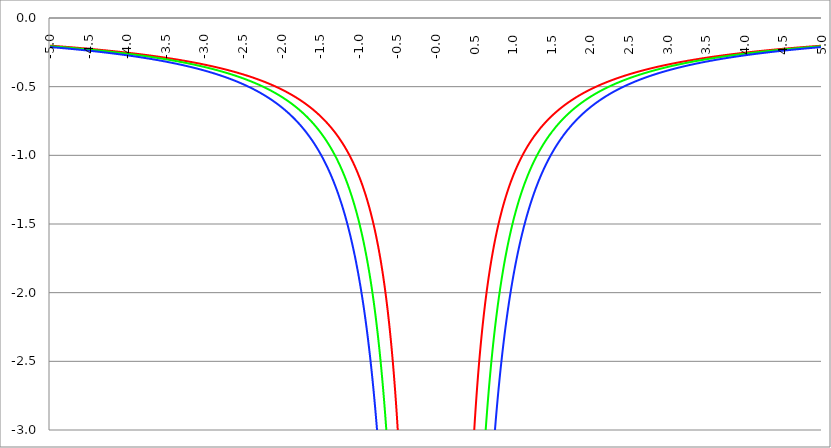
| Category | Series 1 | Series 0 | Series 2 |
|---|---|---|---|
| -5.0 | -0.201 | -0.205 | -0.211 |
| -4.995 | -0.202 | -0.205 | -0.212 |
| -4.99 | -0.202 | -0.206 | -0.212 |
| -4.985 | -0.202 | -0.206 | -0.212 |
| -4.98 | -0.202 | -0.206 | -0.212 |
| -4.975 | -0.202 | -0.206 | -0.213 |
| -4.97 | -0.203 | -0.207 | -0.213 |
| -4.965000000000001 | -0.203 | -0.207 | -0.213 |
| -4.960000000000001 | -0.203 | -0.207 | -0.213 |
| -4.955000000000001 | -0.203 | -0.207 | -0.214 |
| -4.950000000000001 | -0.203 | -0.207 | -0.214 |
| -4.945000000000001 | -0.204 | -0.208 | -0.214 |
| -4.940000000000001 | -0.204 | -0.208 | -0.214 |
| -4.935000000000001 | -0.204 | -0.208 | -0.215 |
| -4.930000000000001 | -0.204 | -0.208 | -0.215 |
| -4.925000000000002 | -0.204 | -0.208 | -0.215 |
| -4.920000000000002 | -0.205 | -0.209 | -0.215 |
| -4.915000000000002 | -0.205 | -0.209 | -0.215 |
| -4.910000000000002 | -0.205 | -0.209 | -0.216 |
| -4.905000000000002 | -0.205 | -0.209 | -0.216 |
| -4.900000000000002 | -0.205 | -0.21 | -0.216 |
| -4.895000000000002 | -0.206 | -0.21 | -0.216 |
| -4.890000000000002 | -0.206 | -0.21 | -0.217 |
| -4.885000000000002 | -0.206 | -0.21 | -0.217 |
| -4.880000000000002 | -0.206 | -0.211 | -0.217 |
| -4.875000000000003 | -0.207 | -0.211 | -0.217 |
| -4.870000000000003 | -0.207 | -0.211 | -0.218 |
| -4.865000000000003 | -0.207 | -0.211 | -0.218 |
| -4.860000000000003 | -0.207 | -0.211 | -0.218 |
| -4.855000000000003 | -0.207 | -0.212 | -0.218 |
| -4.850000000000003 | -0.208 | -0.212 | -0.219 |
| -4.845000000000003 | -0.208 | -0.212 | -0.219 |
| -4.840000000000003 | -0.208 | -0.212 | -0.219 |
| -4.835000000000003 | -0.208 | -0.213 | -0.219 |
| -4.830000000000004 | -0.209 | -0.213 | -0.22 |
| -4.825000000000004 | -0.209 | -0.213 | -0.22 |
| -4.820000000000004 | -0.209 | -0.213 | -0.22 |
| -4.815000000000004 | -0.209 | -0.214 | -0.22 |
| -4.810000000000004 | -0.209 | -0.214 | -0.221 |
| -4.805000000000004 | -0.21 | -0.214 | -0.221 |
| -4.800000000000004 | -0.21 | -0.214 | -0.221 |
| -4.795000000000004 | -0.21 | -0.214 | -0.221 |
| -4.790000000000004 | -0.21 | -0.215 | -0.222 |
| -4.785000000000004 | -0.21 | -0.215 | -0.222 |
| -4.780000000000004 | -0.211 | -0.215 | -0.222 |
| -4.775000000000004 | -0.211 | -0.215 | -0.222 |
| -4.770000000000004 | -0.211 | -0.216 | -0.223 |
| -4.765000000000005 | -0.211 | -0.216 | -0.223 |
| -4.760000000000005 | -0.212 | -0.216 | -0.223 |
| -4.755000000000005 | -0.212 | -0.216 | -0.224 |
| -4.750000000000005 | -0.212 | -0.217 | -0.224 |
| -4.745000000000005 | -0.212 | -0.217 | -0.224 |
| -4.740000000000005 | -0.213 | -0.217 | -0.224 |
| -4.735000000000005 | -0.213 | -0.217 | -0.225 |
| -4.730000000000005 | -0.213 | -0.218 | -0.225 |
| -4.725000000000006 | -0.213 | -0.218 | -0.225 |
| -4.720000000000006 | -0.213 | -0.218 | -0.225 |
| -4.715000000000006 | -0.214 | -0.218 | -0.226 |
| -4.710000000000006 | -0.214 | -0.219 | -0.226 |
| -4.705000000000006 | -0.214 | -0.219 | -0.226 |
| -4.700000000000006 | -0.214 | -0.219 | -0.226 |
| -4.695000000000006 | -0.215 | -0.219 | -0.227 |
| -4.690000000000006 | -0.215 | -0.22 | -0.227 |
| -4.685000000000007 | -0.215 | -0.22 | -0.227 |
| -4.680000000000007 | -0.215 | -0.22 | -0.228 |
| -4.675000000000007 | -0.216 | -0.22 | -0.228 |
| -4.670000000000007 | -0.216 | -0.221 | -0.228 |
| -4.665000000000007 | -0.216 | -0.221 | -0.228 |
| -4.660000000000007 | -0.216 | -0.221 | -0.229 |
| -4.655000000000007 | -0.216 | -0.221 | -0.229 |
| -4.650000000000007 | -0.217 | -0.222 | -0.229 |
| -4.645000000000007 | -0.217 | -0.222 | -0.229 |
| -4.640000000000008 | -0.217 | -0.222 | -0.23 |
| -4.635000000000008 | -0.217 | -0.222 | -0.23 |
| -4.630000000000008 | -0.218 | -0.223 | -0.23 |
| -4.625000000000008 | -0.218 | -0.223 | -0.231 |
| -4.620000000000008 | -0.218 | -0.223 | -0.231 |
| -4.615000000000008 | -0.218 | -0.223 | -0.231 |
| -4.610000000000008 | -0.219 | -0.224 | -0.231 |
| -4.605000000000008 | -0.219 | -0.224 | -0.232 |
| -4.600000000000008 | -0.219 | -0.224 | -0.232 |
| -4.595000000000009 | -0.219 | -0.224 | -0.232 |
| -4.590000000000009 | -0.22 | -0.225 | -0.233 |
| -4.585000000000009 | -0.22 | -0.225 | -0.233 |
| -4.580000000000009 | -0.22 | -0.225 | -0.233 |
| -4.57500000000001 | -0.22 | -0.225 | -0.233 |
| -4.57000000000001 | -0.221 | -0.226 | -0.234 |
| -4.565000000000009 | -0.221 | -0.226 | -0.234 |
| -4.560000000000009 | -0.221 | -0.226 | -0.234 |
| -4.555000000000009 | -0.221 | -0.226 | -0.235 |
| -4.55000000000001 | -0.222 | -0.227 | -0.235 |
| -4.54500000000001 | -0.222 | -0.227 | -0.235 |
| -4.54000000000001 | -0.222 | -0.227 | -0.235 |
| -4.53500000000001 | -0.222 | -0.227 | -0.236 |
| -4.53000000000001 | -0.223 | -0.228 | -0.236 |
| -4.52500000000001 | -0.223 | -0.228 | -0.236 |
| -4.52000000000001 | -0.223 | -0.228 | -0.237 |
| -4.51500000000001 | -0.223 | -0.229 | -0.237 |
| -4.51000000000001 | -0.224 | -0.229 | -0.237 |
| -4.505000000000011 | -0.224 | -0.229 | -0.237 |
| -4.500000000000011 | -0.224 | -0.229 | -0.238 |
| -4.495000000000011 | -0.224 | -0.23 | -0.238 |
| -4.490000000000011 | -0.225 | -0.23 | -0.238 |
| -4.485000000000011 | -0.225 | -0.23 | -0.239 |
| -4.480000000000011 | -0.225 | -0.23 | -0.239 |
| -4.475000000000011 | -0.225 | -0.231 | -0.239 |
| -4.470000000000011 | -0.226 | -0.231 | -0.24 |
| -4.465000000000011 | -0.226 | -0.231 | -0.24 |
| -4.460000000000011 | -0.226 | -0.232 | -0.24 |
| -4.455000000000012 | -0.226 | -0.232 | -0.24 |
| -4.450000000000012 | -0.227 | -0.232 | -0.241 |
| -4.445000000000012 | -0.227 | -0.232 | -0.241 |
| -4.440000000000012 | -0.227 | -0.233 | -0.241 |
| -4.435000000000012 | -0.227 | -0.233 | -0.242 |
| -4.430000000000012 | -0.228 | -0.233 | -0.242 |
| -4.425000000000012 | -0.228 | -0.233 | -0.242 |
| -4.420000000000012 | -0.228 | -0.234 | -0.243 |
| -4.415000000000012 | -0.228 | -0.234 | -0.243 |
| -4.410000000000013 | -0.229 | -0.234 | -0.243 |
| -4.405000000000013 | -0.229 | -0.235 | -0.244 |
| -4.400000000000013 | -0.229 | -0.235 | -0.244 |
| -4.395000000000013 | -0.229 | -0.235 | -0.244 |
| -4.390000000000013 | -0.23 | -0.235 | -0.244 |
| -4.385000000000013 | -0.23 | -0.236 | -0.245 |
| -4.380000000000013 | -0.23 | -0.236 | -0.245 |
| -4.375000000000013 | -0.231 | -0.236 | -0.245 |
| -4.370000000000013 | -0.231 | -0.237 | -0.246 |
| -4.365000000000013 | -0.231 | -0.237 | -0.246 |
| -4.360000000000014 | -0.231 | -0.237 | -0.246 |
| -4.355000000000014 | -0.232 | -0.237 | -0.247 |
| -4.350000000000014 | -0.232 | -0.238 | -0.247 |
| -4.345000000000014 | -0.232 | -0.238 | -0.247 |
| -4.340000000000014 | -0.232 | -0.238 | -0.248 |
| -4.335000000000014 | -0.233 | -0.239 | -0.248 |
| -4.330000000000014 | -0.233 | -0.239 | -0.248 |
| -4.325000000000014 | -0.233 | -0.239 | -0.249 |
| -4.320000000000014 | -0.234 | -0.24 | -0.249 |
| -4.315000000000015 | -0.234 | -0.24 | -0.249 |
| -4.310000000000015 | -0.234 | -0.24 | -0.25 |
| -4.305000000000015 | -0.234 | -0.24 | -0.25 |
| -4.300000000000015 | -0.235 | -0.241 | -0.25 |
| -4.295000000000015 | -0.235 | -0.241 | -0.251 |
| -4.290000000000015 | -0.235 | -0.241 | -0.251 |
| -4.285000000000015 | -0.235 | -0.242 | -0.251 |
| -4.280000000000015 | -0.236 | -0.242 | -0.252 |
| -4.275000000000015 | -0.236 | -0.242 | -0.252 |
| -4.270000000000015 | -0.236 | -0.242 | -0.252 |
| -4.265000000000016 | -0.237 | -0.243 | -0.253 |
| -4.260000000000016 | -0.237 | -0.243 | -0.253 |
| -4.255000000000016 | -0.237 | -0.243 | -0.253 |
| -4.250000000000016 | -0.237 | -0.244 | -0.254 |
| -4.245000000000016 | -0.238 | -0.244 | -0.254 |
| -4.240000000000016 | -0.238 | -0.244 | -0.254 |
| -4.235000000000016 | -0.238 | -0.245 | -0.255 |
| -4.230000000000016 | -0.239 | -0.245 | -0.255 |
| -4.225000000000017 | -0.239 | -0.245 | -0.255 |
| -4.220000000000017 | -0.239 | -0.246 | -0.256 |
| -4.215000000000017 | -0.239 | -0.246 | -0.256 |
| -4.210000000000017 | -0.24 | -0.246 | -0.256 |
| -4.205000000000017 | -0.24 | -0.246 | -0.257 |
| -4.200000000000017 | -0.24 | -0.247 | -0.257 |
| -4.195000000000017 | -0.241 | -0.247 | -0.257 |
| -4.190000000000017 | -0.241 | -0.247 | -0.258 |
| -4.185000000000017 | -0.241 | -0.248 | -0.258 |
| -4.180000000000017 | -0.241 | -0.248 | -0.258 |
| -4.175000000000018 | -0.242 | -0.248 | -0.259 |
| -4.170000000000018 | -0.242 | -0.249 | -0.259 |
| -4.165000000000018 | -0.242 | -0.249 | -0.259 |
| -4.160000000000018 | -0.243 | -0.249 | -0.26 |
| -4.155000000000018 | -0.243 | -0.25 | -0.26 |
| -4.150000000000018 | -0.243 | -0.25 | -0.261 |
| -4.145000000000018 | -0.244 | -0.25 | -0.261 |
| -4.140000000000018 | -0.244 | -0.251 | -0.261 |
| -4.135000000000018 | -0.244 | -0.251 | -0.262 |
| -4.130000000000019 | -0.244 | -0.251 | -0.262 |
| -4.125000000000019 | -0.245 | -0.252 | -0.262 |
| -4.120000000000019 | -0.245 | -0.252 | -0.263 |
| -4.115000000000019 | -0.245 | -0.252 | -0.263 |
| -4.110000000000019 | -0.246 | -0.253 | -0.263 |
| -4.105000000000019 | -0.246 | -0.253 | -0.264 |
| -4.100000000000019 | -0.246 | -0.253 | -0.264 |
| -4.095000000000019 | -0.247 | -0.254 | -0.265 |
| -4.090000000000019 | -0.247 | -0.254 | -0.265 |
| -4.085000000000019 | -0.247 | -0.254 | -0.265 |
| -4.08000000000002 | -0.248 | -0.255 | -0.266 |
| -4.07500000000002 | -0.248 | -0.255 | -0.266 |
| -4.07000000000002 | -0.248 | -0.255 | -0.266 |
| -4.06500000000002 | -0.248 | -0.256 | -0.267 |
| -4.06000000000002 | -0.249 | -0.256 | -0.267 |
| -4.05500000000002 | -0.249 | -0.256 | -0.268 |
| -4.05000000000002 | -0.249 | -0.257 | -0.268 |
| -4.04500000000002 | -0.25 | -0.257 | -0.268 |
| -4.04000000000002 | -0.25 | -0.257 | -0.269 |
| -4.03500000000002 | -0.25 | -0.258 | -0.269 |
| -4.03000000000002 | -0.251 | -0.258 | -0.269 |
| -4.025000000000021 | -0.251 | -0.258 | -0.27 |
| -4.020000000000021 | -0.251 | -0.259 | -0.27 |
| -4.015000000000021 | -0.252 | -0.259 | -0.271 |
| -4.010000000000021 | -0.252 | -0.259 | -0.271 |
| -4.005000000000021 | -0.252 | -0.26 | -0.271 |
| -4.000000000000021 | -0.253 | -0.26 | -0.272 |
| -3.995000000000021 | -0.253 | -0.26 | -0.272 |
| -3.990000000000021 | -0.253 | -0.261 | -0.273 |
| -3.985000000000022 | -0.254 | -0.261 | -0.273 |
| -3.980000000000022 | -0.254 | -0.261 | -0.273 |
| -3.975000000000022 | -0.254 | -0.262 | -0.274 |
| -3.970000000000022 | -0.255 | -0.262 | -0.274 |
| -3.965000000000022 | -0.255 | -0.263 | -0.275 |
| -3.960000000000022 | -0.255 | -0.263 | -0.275 |
| -3.955000000000022 | -0.256 | -0.263 | -0.275 |
| -3.950000000000022 | -0.256 | -0.264 | -0.276 |
| -3.945000000000022 | -0.256 | -0.264 | -0.276 |
| -3.940000000000023 | -0.257 | -0.264 | -0.277 |
| -3.935000000000023 | -0.257 | -0.265 | -0.277 |
| -3.930000000000023 | -0.257 | -0.265 | -0.277 |
| -3.925000000000023 | -0.258 | -0.265 | -0.278 |
| -3.920000000000023 | -0.258 | -0.266 | -0.278 |
| -3.915000000000023 | -0.258 | -0.266 | -0.279 |
| -3.910000000000023 | -0.259 | -0.267 | -0.279 |
| -3.905000000000023 | -0.259 | -0.267 | -0.279 |
| -3.900000000000023 | -0.259 | -0.267 | -0.28 |
| -3.895000000000023 | -0.26 | -0.268 | -0.28 |
| -3.890000000000024 | -0.26 | -0.268 | -0.281 |
| -3.885000000000024 | -0.26 | -0.268 | -0.281 |
| -3.880000000000024 | -0.261 | -0.269 | -0.281 |
| -3.875000000000024 | -0.261 | -0.269 | -0.282 |
| -3.870000000000024 | -0.261 | -0.269 | -0.282 |
| -3.865000000000024 | -0.262 | -0.27 | -0.283 |
| -3.860000000000024 | -0.262 | -0.27 | -0.283 |
| -3.855000000000024 | -0.262 | -0.271 | -0.284 |
| -3.850000000000024 | -0.263 | -0.271 | -0.284 |
| -3.845000000000025 | -0.263 | -0.271 | -0.284 |
| -3.840000000000025 | -0.263 | -0.272 | -0.285 |
| -3.835000000000025 | -0.264 | -0.272 | -0.285 |
| -3.830000000000025 | -0.264 | -0.273 | -0.286 |
| -3.825000000000025 | -0.264 | -0.273 | -0.286 |
| -3.820000000000025 | -0.265 | -0.273 | -0.287 |
| -3.815000000000025 | -0.265 | -0.274 | -0.287 |
| -3.810000000000025 | -0.265 | -0.274 | -0.287 |
| -3.805000000000025 | -0.266 | -0.274 | -0.288 |
| -3.800000000000026 | -0.266 | -0.275 | -0.288 |
| -3.795000000000026 | -0.267 | -0.275 | -0.289 |
| -3.790000000000026 | -0.267 | -0.276 | -0.289 |
| -3.785000000000026 | -0.267 | -0.276 | -0.29 |
| -3.780000000000026 | -0.268 | -0.276 | -0.29 |
| -3.775000000000026 | -0.268 | -0.277 | -0.291 |
| -3.770000000000026 | -0.268 | -0.277 | -0.291 |
| -3.765000000000026 | -0.269 | -0.278 | -0.292 |
| -3.760000000000026 | -0.269 | -0.278 | -0.292 |
| -3.755000000000026 | -0.269 | -0.278 | -0.292 |
| -3.750000000000027 | -0.27 | -0.279 | -0.293 |
| -3.745000000000027 | -0.27 | -0.279 | -0.293 |
| -3.740000000000027 | -0.271 | -0.28 | -0.294 |
| -3.735000000000027 | -0.271 | -0.28 | -0.294 |
| -3.730000000000027 | -0.271 | -0.28 | -0.295 |
| -3.725000000000027 | -0.272 | -0.281 | -0.295 |
| -3.720000000000027 | -0.272 | -0.281 | -0.296 |
| -3.715000000000027 | -0.272 | -0.282 | -0.296 |
| -3.710000000000027 | -0.273 | -0.282 | -0.297 |
| -3.705000000000028 | -0.273 | -0.282 | -0.297 |
| -3.700000000000028 | -0.274 | -0.283 | -0.297 |
| -3.695000000000028 | -0.274 | -0.283 | -0.298 |
| -3.690000000000028 | -0.274 | -0.284 | -0.298 |
| -3.685000000000028 | -0.275 | -0.284 | -0.299 |
| -3.680000000000028 | -0.275 | -0.285 | -0.299 |
| -3.675000000000028 | -0.275 | -0.285 | -0.3 |
| -3.670000000000028 | -0.276 | -0.285 | -0.3 |
| -3.665000000000028 | -0.276 | -0.286 | -0.301 |
| -3.660000000000028 | -0.277 | -0.286 | -0.301 |
| -3.655000000000029 | -0.277 | -0.287 | -0.302 |
| -3.650000000000029 | -0.277 | -0.287 | -0.302 |
| -3.645000000000029 | -0.278 | -0.288 | -0.303 |
| -3.640000000000029 | -0.278 | -0.288 | -0.303 |
| -3.635000000000029 | -0.279 | -0.288 | -0.304 |
| -3.630000000000029 | -0.279 | -0.289 | -0.304 |
| -3.625000000000029 | -0.279 | -0.289 | -0.305 |
| -3.620000000000029 | -0.28 | -0.29 | -0.305 |
| -3.615000000000029 | -0.28 | -0.29 | -0.306 |
| -3.61000000000003 | -0.281 | -0.291 | -0.306 |
| -3.60500000000003 | -0.281 | -0.291 | -0.307 |
| -3.60000000000003 | -0.281 | -0.291 | -0.307 |
| -3.59500000000003 | -0.282 | -0.292 | -0.308 |
| -3.59000000000003 | -0.282 | -0.292 | -0.308 |
| -3.58500000000003 | -0.283 | -0.293 | -0.309 |
| -3.58000000000003 | -0.283 | -0.293 | -0.309 |
| -3.57500000000003 | -0.283 | -0.294 | -0.31 |
| -3.57000000000003 | -0.284 | -0.294 | -0.31 |
| -3.565000000000031 | -0.284 | -0.295 | -0.311 |
| -3.560000000000031 | -0.285 | -0.295 | -0.311 |
| -3.555000000000031 | -0.285 | -0.295 | -0.312 |
| -3.550000000000031 | -0.285 | -0.296 | -0.312 |
| -3.545000000000031 | -0.286 | -0.296 | -0.313 |
| -3.540000000000031 | -0.286 | -0.297 | -0.313 |
| -3.535000000000031 | -0.287 | -0.297 | -0.314 |
| -3.530000000000031 | -0.287 | -0.298 | -0.314 |
| -3.525000000000031 | -0.287 | -0.298 | -0.315 |
| -3.520000000000032 | -0.288 | -0.299 | -0.315 |
| -3.515000000000032 | -0.288 | -0.299 | -0.316 |
| -3.510000000000032 | -0.289 | -0.3 | -0.317 |
| -3.505000000000032 | -0.289 | -0.3 | -0.317 |
| -3.500000000000032 | -0.29 | -0.301 | -0.318 |
| -3.495000000000032 | -0.29 | -0.301 | -0.318 |
| -3.490000000000032 | -0.29 | -0.302 | -0.319 |
| -3.485000000000032 | -0.291 | -0.302 | -0.319 |
| -3.480000000000032 | -0.291 | -0.302 | -0.32 |
| -3.475000000000032 | -0.292 | -0.303 | -0.32 |
| -3.470000000000033 | -0.292 | -0.303 | -0.321 |
| -3.465000000000033 | -0.293 | -0.304 | -0.321 |
| -3.460000000000033 | -0.293 | -0.304 | -0.322 |
| -3.455000000000033 | -0.293 | -0.305 | -0.323 |
| -3.450000000000033 | -0.294 | -0.305 | -0.323 |
| -3.445000000000033 | -0.294 | -0.306 | -0.324 |
| -3.440000000000033 | -0.295 | -0.306 | -0.324 |
| -3.435000000000033 | -0.295 | -0.307 | -0.325 |
| -3.430000000000033 | -0.296 | -0.307 | -0.325 |
| -3.425000000000034 | -0.296 | -0.308 | -0.326 |
| -3.420000000000034 | -0.297 | -0.308 | -0.326 |
| -3.415000000000034 | -0.297 | -0.309 | -0.327 |
| -3.410000000000034 | -0.297 | -0.309 | -0.328 |
| -3.405000000000034 | -0.298 | -0.31 | -0.328 |
| -3.400000000000034 | -0.298 | -0.31 | -0.329 |
| -3.395000000000034 | -0.299 | -0.311 | -0.329 |
| -3.390000000000034 | -0.299 | -0.311 | -0.33 |
| -3.385000000000034 | -0.3 | -0.312 | -0.33 |
| -3.380000000000034 | -0.3 | -0.312 | -0.331 |
| -3.375000000000035 | -0.301 | -0.313 | -0.332 |
| -3.370000000000035 | -0.301 | -0.313 | -0.332 |
| -3.365000000000035 | -0.301 | -0.314 | -0.333 |
| -3.360000000000035 | -0.302 | -0.314 | -0.333 |
| -3.355000000000035 | -0.302 | -0.315 | -0.334 |
| -3.350000000000035 | -0.303 | -0.315 | -0.335 |
| -3.345000000000035 | -0.303 | -0.316 | -0.335 |
| -3.340000000000035 | -0.304 | -0.316 | -0.336 |
| -3.335000000000035 | -0.304 | -0.317 | -0.336 |
| -3.330000000000036 | -0.305 | -0.317 | -0.337 |
| -3.325000000000036 | -0.305 | -0.318 | -0.338 |
| -3.320000000000036 | -0.306 | -0.319 | -0.338 |
| -3.315000000000036 | -0.306 | -0.319 | -0.339 |
| -3.310000000000036 | -0.307 | -0.32 | -0.339 |
| -3.305000000000036 | -0.307 | -0.32 | -0.34 |
| -3.300000000000036 | -0.308 | -0.321 | -0.341 |
| -3.295000000000036 | -0.308 | -0.321 | -0.341 |
| -3.290000000000036 | -0.309 | -0.322 | -0.342 |
| -3.285000000000036 | -0.309 | -0.322 | -0.343 |
| -3.280000000000036 | -0.31 | -0.323 | -0.343 |
| -3.275000000000037 | -0.31 | -0.323 | -0.344 |
| -3.270000000000037 | -0.311 | -0.324 | -0.344 |
| -3.265000000000037 | -0.311 | -0.324 | -0.345 |
| -3.260000000000037 | -0.311 | -0.325 | -0.346 |
| -3.255000000000037 | -0.312 | -0.326 | -0.346 |
| -3.250000000000037 | -0.312 | -0.326 | -0.347 |
| -3.245000000000037 | -0.313 | -0.327 | -0.348 |
| -3.240000000000037 | -0.313 | -0.327 | -0.348 |
| -3.235000000000038 | -0.314 | -0.328 | -0.349 |
| -3.230000000000038 | -0.314 | -0.328 | -0.35 |
| -3.225000000000038 | -0.315 | -0.329 | -0.35 |
| -3.220000000000038 | -0.315 | -0.33 | -0.351 |
| -3.215000000000038 | -0.316 | -0.33 | -0.352 |
| -3.210000000000038 | -0.316 | -0.331 | -0.352 |
| -3.205000000000038 | -0.317 | -0.331 | -0.353 |
| -3.200000000000038 | -0.318 | -0.332 | -0.354 |
| -3.195000000000038 | -0.318 | -0.332 | -0.354 |
| -3.190000000000039 | -0.319 | -0.333 | -0.355 |
| -3.185000000000039 | -0.319 | -0.334 | -0.356 |
| -3.180000000000039 | -0.32 | -0.334 | -0.356 |
| -3.175000000000039 | -0.32 | -0.335 | -0.357 |
| -3.170000000000039 | -0.321 | -0.335 | -0.358 |
| -3.16500000000004 | -0.321 | -0.336 | -0.358 |
| -3.16000000000004 | -0.322 | -0.336 | -0.359 |
| -3.155000000000039 | -0.322 | -0.337 | -0.36 |
| -3.150000000000039 | -0.323 | -0.338 | -0.36 |
| -3.14500000000004 | -0.323 | -0.338 | -0.361 |
| -3.14000000000004 | -0.324 | -0.339 | -0.362 |
| -3.13500000000004 | -0.324 | -0.339 | -0.363 |
| -3.13000000000004 | -0.325 | -0.34 | -0.363 |
| -3.12500000000004 | -0.325 | -0.341 | -0.364 |
| -3.12000000000004 | -0.326 | -0.341 | -0.365 |
| -3.11500000000004 | -0.326 | -0.342 | -0.365 |
| -3.11000000000004 | -0.327 | -0.343 | -0.366 |
| -3.10500000000004 | -0.328 | -0.343 | -0.367 |
| -3.10000000000004 | -0.328 | -0.344 | -0.368 |
| -3.095000000000041 | -0.329 | -0.344 | -0.368 |
| -3.090000000000041 | -0.329 | -0.345 | -0.369 |
| -3.085000000000041 | -0.33 | -0.346 | -0.37 |
| -3.080000000000041 | -0.33 | -0.346 | -0.37 |
| -3.075000000000041 | -0.331 | -0.347 | -0.371 |
| -3.070000000000041 | -0.331 | -0.347 | -0.372 |
| -3.065000000000041 | -0.332 | -0.348 | -0.373 |
| -3.060000000000041 | -0.333 | -0.349 | -0.373 |
| -3.055000000000041 | -0.333 | -0.349 | -0.374 |
| -3.050000000000042 | -0.334 | -0.35 | -0.375 |
| -3.045000000000042 | -0.334 | -0.351 | -0.376 |
| -3.040000000000042 | -0.335 | -0.351 | -0.376 |
| -3.035000000000042 | -0.335 | -0.352 | -0.377 |
| -3.030000000000042 | -0.336 | -0.353 | -0.378 |
| -3.025000000000042 | -0.337 | -0.353 | -0.379 |
| -3.020000000000042 | -0.337 | -0.354 | -0.379 |
| -3.015000000000042 | -0.338 | -0.355 | -0.38 |
| -3.010000000000042 | -0.338 | -0.355 | -0.381 |
| -3.005000000000043 | -0.339 | -0.356 | -0.382 |
| -3.000000000000043 | -0.339 | -0.357 | -0.383 |
| -2.995000000000043 | -0.34 | -0.357 | -0.383 |
| -2.990000000000043 | -0.341 | -0.358 | -0.384 |
| -2.985000000000043 | -0.341 | -0.359 | -0.385 |
| -2.980000000000043 | -0.342 | -0.359 | -0.386 |
| -2.975000000000043 | -0.342 | -0.36 | -0.387 |
| -2.970000000000043 | -0.343 | -0.361 | -0.387 |
| -2.965000000000043 | -0.344 | -0.361 | -0.388 |
| -2.960000000000043 | -0.344 | -0.362 | -0.389 |
| -2.955000000000044 | -0.345 | -0.363 | -0.39 |
| -2.950000000000044 | -0.345 | -0.363 | -0.391 |
| -2.945000000000044 | -0.346 | -0.364 | -0.391 |
| -2.940000000000044 | -0.347 | -0.365 | -0.392 |
| -2.935000000000044 | -0.347 | -0.365 | -0.393 |
| -2.930000000000044 | -0.348 | -0.366 | -0.394 |
| -2.925000000000044 | -0.348 | -0.367 | -0.395 |
| -2.920000000000044 | -0.349 | -0.368 | -0.396 |
| -2.915000000000044 | -0.35 | -0.368 | -0.396 |
| -2.910000000000045 | -0.35 | -0.369 | -0.397 |
| -2.905000000000045 | -0.351 | -0.37 | -0.398 |
| -2.900000000000045 | -0.352 | -0.37 | -0.399 |
| -2.895000000000045 | -0.352 | -0.371 | -0.4 |
| -2.890000000000045 | -0.353 | -0.372 | -0.401 |
| -2.885000000000045 | -0.353 | -0.373 | -0.402 |
| -2.880000000000045 | -0.354 | -0.373 | -0.402 |
| -2.875000000000045 | -0.355 | -0.374 | -0.403 |
| -2.870000000000045 | -0.355 | -0.375 | -0.404 |
| -2.865000000000045 | -0.356 | -0.376 | -0.405 |
| -2.860000000000046 | -0.357 | -0.376 | -0.406 |
| -2.855000000000046 | -0.357 | -0.377 | -0.407 |
| -2.850000000000046 | -0.358 | -0.378 | -0.408 |
| -2.845000000000046 | -0.359 | -0.379 | -0.409 |
| -2.840000000000046 | -0.359 | -0.379 | -0.41 |
| -2.835000000000046 | -0.36 | -0.38 | -0.41 |
| -2.830000000000046 | -0.361 | -0.381 | -0.411 |
| -2.825000000000046 | -0.361 | -0.382 | -0.412 |
| -2.820000000000046 | -0.362 | -0.382 | -0.413 |
| -2.815000000000047 | -0.363 | -0.383 | -0.414 |
| -2.810000000000047 | -0.363 | -0.384 | -0.415 |
| -2.805000000000047 | -0.364 | -0.385 | -0.416 |
| -2.800000000000047 | -0.365 | -0.386 | -0.417 |
| -2.795000000000047 | -0.365 | -0.386 | -0.418 |
| -2.790000000000047 | -0.366 | -0.387 | -0.419 |
| -2.785000000000047 | -0.367 | -0.388 | -0.42 |
| -2.780000000000047 | -0.367 | -0.389 | -0.421 |
| -2.775000000000047 | -0.368 | -0.389 | -0.422 |
| -2.770000000000047 | -0.369 | -0.39 | -0.423 |
| -2.765000000000048 | -0.369 | -0.391 | -0.424 |
| -2.760000000000048 | -0.37 | -0.392 | -0.424 |
| -2.755000000000048 | -0.371 | -0.393 | -0.425 |
| -2.750000000000048 | -0.371 | -0.394 | -0.426 |
| -2.745000000000048 | -0.372 | -0.394 | -0.427 |
| -2.740000000000048 | -0.373 | -0.395 | -0.428 |
| -2.735000000000048 | -0.374 | -0.396 | -0.429 |
| -2.730000000000048 | -0.374 | -0.397 | -0.43 |
| -2.725000000000048 | -0.375 | -0.398 | -0.431 |
| -2.720000000000049 | -0.376 | -0.399 | -0.432 |
| -2.715000000000049 | -0.376 | -0.399 | -0.433 |
| -2.710000000000049 | -0.377 | -0.4 | -0.434 |
| -2.705000000000049 | -0.378 | -0.401 | -0.435 |
| -2.700000000000049 | -0.379 | -0.402 | -0.436 |
| -2.695000000000049 | -0.379 | -0.403 | -0.437 |
| -2.690000000000049 | -0.38 | -0.404 | -0.439 |
| -2.685000000000049 | -0.381 | -0.404 | -0.44 |
| -2.680000000000049 | -0.382 | -0.405 | -0.441 |
| -2.675000000000049 | -0.382 | -0.406 | -0.442 |
| -2.67000000000005 | -0.383 | -0.407 | -0.443 |
| -2.66500000000005 | -0.384 | -0.408 | -0.444 |
| -2.66000000000005 | -0.385 | -0.409 | -0.445 |
| -2.65500000000005 | -0.385 | -0.41 | -0.446 |
| -2.65000000000005 | -0.386 | -0.411 | -0.447 |
| -2.64500000000005 | -0.387 | -0.412 | -0.448 |
| -2.64000000000005 | -0.388 | -0.412 | -0.449 |
| -2.63500000000005 | -0.388 | -0.413 | -0.45 |
| -2.63000000000005 | -0.389 | -0.414 | -0.451 |
| -2.625000000000051 | -0.39 | -0.415 | -0.452 |
| -2.620000000000051 | -0.391 | -0.416 | -0.454 |
| -2.615000000000051 | -0.392 | -0.417 | -0.455 |
| -2.610000000000051 | -0.392 | -0.418 | -0.456 |
| -2.605000000000051 | -0.393 | -0.419 | -0.457 |
| -2.600000000000051 | -0.394 | -0.42 | -0.458 |
| -2.595000000000051 | -0.395 | -0.421 | -0.459 |
| -2.590000000000051 | -0.395 | -0.422 | -0.46 |
| -2.585000000000051 | -0.396 | -0.423 | -0.461 |
| -2.580000000000052 | -0.397 | -0.424 | -0.463 |
| -2.575000000000052 | -0.398 | -0.424 | -0.464 |
| -2.570000000000052 | -0.399 | -0.425 | -0.465 |
| -2.565000000000052 | -0.4 | -0.426 | -0.466 |
| -2.560000000000052 | -0.4 | -0.427 | -0.467 |
| -2.555000000000052 | -0.401 | -0.428 | -0.468 |
| -2.550000000000052 | -0.402 | -0.429 | -0.47 |
| -2.545000000000052 | -0.403 | -0.43 | -0.471 |
| -2.540000000000052 | -0.404 | -0.431 | -0.472 |
| -2.535000000000053 | -0.404 | -0.432 | -0.473 |
| -2.530000000000053 | -0.405 | -0.433 | -0.474 |
| -2.525000000000053 | -0.406 | -0.434 | -0.476 |
| -2.520000000000053 | -0.407 | -0.435 | -0.477 |
| -2.515000000000053 | -0.408 | -0.436 | -0.478 |
| -2.510000000000053 | -0.409 | -0.437 | -0.479 |
| -2.505000000000053 | -0.41 | -0.438 | -0.48 |
| -2.500000000000053 | -0.41 | -0.439 | -0.482 |
| -2.495000000000053 | -0.411 | -0.44 | -0.483 |
| -2.490000000000053 | -0.412 | -0.441 | -0.484 |
| -2.485000000000054 | -0.413 | -0.442 | -0.486 |
| -2.480000000000054 | -0.414 | -0.443 | -0.487 |
| -2.475000000000054 | -0.415 | -0.444 | -0.488 |
| -2.470000000000054 | -0.416 | -0.446 | -0.489 |
| -2.465000000000054 | -0.417 | -0.447 | -0.491 |
| -2.460000000000054 | -0.417 | -0.448 | -0.492 |
| -2.455000000000054 | -0.418 | -0.449 | -0.493 |
| -2.450000000000054 | -0.419 | -0.45 | -0.495 |
| -2.445000000000054 | -0.42 | -0.451 | -0.496 |
| -2.440000000000055 | -0.421 | -0.452 | -0.497 |
| -2.435000000000055 | -0.422 | -0.453 | -0.499 |
| -2.430000000000055 | -0.423 | -0.454 | -0.5 |
| -2.425000000000055 | -0.424 | -0.455 | -0.501 |
| -2.420000000000055 | -0.425 | -0.456 | -0.503 |
| -2.415000000000055 | -0.426 | -0.457 | -0.504 |
| -2.410000000000055 | -0.427 | -0.459 | -0.505 |
| -2.405000000000055 | -0.427 | -0.46 | -0.507 |
| -2.400000000000055 | -0.428 | -0.461 | -0.508 |
| -2.395000000000055 | -0.429 | -0.462 | -0.509 |
| -2.390000000000056 | -0.43 | -0.463 | -0.511 |
| -2.385000000000056 | -0.431 | -0.464 | -0.512 |
| -2.380000000000056 | -0.432 | -0.465 | -0.514 |
| -2.375000000000056 | -0.433 | -0.467 | -0.515 |
| -2.370000000000056 | -0.434 | -0.468 | -0.517 |
| -2.365000000000056 | -0.435 | -0.469 | -0.518 |
| -2.360000000000056 | -0.436 | -0.47 | -0.519 |
| -2.355000000000056 | -0.437 | -0.471 | -0.521 |
| -2.350000000000056 | -0.438 | -0.472 | -0.522 |
| -2.345000000000057 | -0.439 | -0.474 | -0.524 |
| -2.340000000000057 | -0.44 | -0.475 | -0.525 |
| -2.335000000000057 | -0.441 | -0.476 | -0.527 |
| -2.330000000000057 | -0.442 | -0.477 | -0.528 |
| -2.325000000000057 | -0.443 | -0.478 | -0.53 |
| -2.320000000000057 | -0.444 | -0.48 | -0.531 |
| -2.315000000000057 | -0.445 | -0.481 | -0.533 |
| -2.310000000000057 | -0.446 | -0.482 | -0.534 |
| -2.305000000000057 | -0.447 | -0.483 | -0.536 |
| -2.300000000000058 | -0.448 | -0.485 | -0.537 |
| -2.295000000000058 | -0.449 | -0.486 | -0.539 |
| -2.290000000000058 | -0.45 | -0.487 | -0.541 |
| -2.285000000000058 | -0.451 | -0.488 | -0.542 |
| -2.280000000000058 | -0.452 | -0.49 | -0.544 |
| -2.275000000000058 | -0.453 | -0.491 | -0.545 |
| -2.270000000000058 | -0.454 | -0.492 | -0.547 |
| -2.265000000000058 | -0.455 | -0.494 | -0.549 |
| -2.260000000000058 | -0.457 | -0.495 | -0.55 |
| -2.255000000000058 | -0.458 | -0.496 | -0.552 |
| -2.250000000000059 | -0.459 | -0.497 | -0.553 |
| -2.245000000000059 | -0.46 | -0.499 | -0.555 |
| -2.240000000000059 | -0.461 | -0.5 | -0.557 |
| -2.235000000000059 | -0.462 | -0.501 | -0.558 |
| -2.23000000000006 | -0.463 | -0.503 | -0.56 |
| -2.22500000000006 | -0.464 | -0.504 | -0.562 |
| -2.22000000000006 | -0.465 | -0.506 | -0.564 |
| -2.215000000000059 | -0.466 | -0.507 | -0.565 |
| -2.210000000000059 | -0.467 | -0.508 | -0.567 |
| -2.20500000000006 | -0.469 | -0.51 | -0.569 |
| -2.20000000000006 | -0.47 | -0.511 | -0.57 |
| -2.19500000000006 | -0.471 | -0.512 | -0.572 |
| -2.19000000000006 | -0.472 | -0.514 | -0.574 |
| -2.18500000000006 | -0.473 | -0.515 | -0.576 |
| -2.18000000000006 | -0.474 | -0.517 | -0.578 |
| -2.17500000000006 | -0.475 | -0.518 | -0.579 |
| -2.17000000000006 | -0.477 | -0.52 | -0.581 |
| -2.16500000000006 | -0.478 | -0.521 | -0.583 |
| -2.160000000000061 | -0.479 | -0.522 | -0.585 |
| -2.155000000000061 | -0.48 | -0.524 | -0.587 |
| -2.150000000000061 | -0.481 | -0.525 | -0.588 |
| -2.145000000000061 | -0.483 | -0.527 | -0.59 |
| -2.140000000000061 | -0.484 | -0.528 | -0.592 |
| -2.135000000000061 | -0.485 | -0.53 | -0.594 |
| -2.130000000000061 | -0.486 | -0.531 | -0.596 |
| -2.125000000000061 | -0.487 | -0.533 | -0.598 |
| -2.120000000000061 | -0.489 | -0.534 | -0.6 |
| -2.115000000000061 | -0.49 | -0.536 | -0.602 |
| -2.110000000000062 | -0.491 | -0.538 | -0.604 |
| -2.105000000000062 | -0.492 | -0.539 | -0.606 |
| -2.100000000000062 | -0.494 | -0.541 | -0.608 |
| -2.095000000000062 | -0.495 | -0.542 | -0.61 |
| -2.090000000000062 | -0.496 | -0.544 | -0.612 |
| -2.085000000000062 | -0.497 | -0.545 | -0.614 |
| -2.080000000000062 | -0.499 | -0.547 | -0.616 |
| -2.075000000000062 | -0.5 | -0.549 | -0.618 |
| -2.070000000000062 | -0.501 | -0.55 | -0.62 |
| -2.065000000000063 | -0.503 | -0.552 | -0.622 |
| -2.060000000000063 | -0.504 | -0.553 | -0.624 |
| -2.055000000000063 | -0.505 | -0.555 | -0.626 |
| -2.050000000000063 | -0.507 | -0.557 | -0.628 |
| -2.045000000000063 | -0.508 | -0.558 | -0.63 |
| -2.040000000000063 | -0.509 | -0.56 | -0.632 |
| -2.035000000000063 | -0.511 | -0.562 | -0.634 |
| -2.030000000000063 | -0.512 | -0.563 | -0.637 |
| -2.025000000000063 | -0.513 | -0.565 | -0.639 |
| -2.020000000000064 | -0.515 | -0.567 | -0.641 |
| -2.015000000000064 | -0.516 | -0.569 | -0.643 |
| -2.010000000000064 | -0.517 | -0.57 | -0.645 |
| -2.005000000000064 | -0.519 | -0.572 | -0.648 |
| -2.000000000000064 | -0.52 | -0.574 | -0.65 |
| -1.995000000000064 | -0.522 | -0.576 | -0.652 |
| -1.990000000000064 | -0.523 | -0.577 | -0.654 |
| -1.985000000000064 | -0.524 | -0.579 | -0.657 |
| -1.980000000000064 | -0.526 | -0.581 | -0.659 |
| -1.975000000000064 | -0.527 | -0.583 | -0.661 |
| -1.970000000000065 | -0.529 | -0.585 | -0.664 |
| -1.965000000000065 | -0.53 | -0.587 | -0.666 |
| -1.960000000000065 | -0.532 | -0.588 | -0.668 |
| -1.955000000000065 | -0.533 | -0.59 | -0.671 |
| -1.950000000000065 | -0.534 | -0.592 | -0.673 |
| -1.945000000000065 | -0.536 | -0.594 | -0.676 |
| -1.940000000000065 | -0.537 | -0.596 | -0.678 |
| -1.935000000000065 | -0.539 | -0.598 | -0.68 |
| -1.930000000000065 | -0.54 | -0.6 | -0.683 |
| -1.925000000000066 | -0.542 | -0.602 | -0.685 |
| -1.920000000000066 | -0.544 | -0.604 | -0.688 |
| -1.915000000000066 | -0.545 | -0.606 | -0.69 |
| -1.910000000000066 | -0.547 | -0.608 | -0.693 |
| -1.905000000000066 | -0.548 | -0.61 | -0.696 |
| -1.900000000000066 | -0.55 | -0.612 | -0.698 |
| -1.895000000000066 | -0.551 | -0.614 | -0.701 |
| -1.890000000000066 | -0.553 | -0.616 | -0.703 |
| -1.885000000000066 | -0.554 | -0.618 | -0.706 |
| -1.880000000000066 | -0.556 | -0.62 | -0.709 |
| -1.875000000000067 | -0.558 | -0.622 | -0.711 |
| -1.870000000000067 | -0.559 | -0.624 | -0.714 |
| -1.865000000000067 | -0.561 | -0.626 | -0.717 |
| -1.860000000000067 | -0.563 | -0.628 | -0.719 |
| -1.855000000000067 | -0.564 | -0.63 | -0.722 |
| -1.850000000000067 | -0.566 | -0.632 | -0.725 |
| -1.845000000000067 | -0.567 | -0.635 | -0.728 |
| -1.840000000000067 | -0.569 | -0.637 | -0.731 |
| -1.835000000000067 | -0.571 | -0.639 | -0.733 |
| -1.830000000000068 | -0.573 | -0.641 | -0.736 |
| -1.825000000000068 | -0.574 | -0.643 | -0.739 |
| -1.820000000000068 | -0.576 | -0.646 | -0.742 |
| -1.815000000000068 | -0.578 | -0.648 | -0.745 |
| -1.810000000000068 | -0.579 | -0.65 | -0.748 |
| -1.805000000000068 | -0.581 | -0.652 | -0.751 |
| -1.800000000000068 | -0.583 | -0.655 | -0.754 |
| -1.795000000000068 | -0.585 | -0.657 | -0.757 |
| -1.790000000000068 | -0.586 | -0.659 | -0.76 |
| -1.785000000000068 | -0.588 | -0.662 | -0.763 |
| -1.780000000000069 | -0.59 | -0.664 | -0.766 |
| -1.775000000000069 | -0.592 | -0.666 | -0.769 |
| -1.770000000000069 | -0.594 | -0.669 | -0.772 |
| -1.765000000000069 | -0.596 | -0.671 | -0.775 |
| -1.760000000000069 | -0.597 | -0.674 | -0.779 |
| -1.75500000000007 | -0.599 | -0.676 | -0.782 |
| -1.75000000000007 | -0.601 | -0.679 | -0.785 |
| -1.745000000000069 | -0.603 | -0.681 | -0.788 |
| -1.740000000000069 | -0.605 | -0.684 | -0.792 |
| -1.73500000000007 | -0.607 | -0.686 | -0.795 |
| -1.73000000000007 | -0.609 | -0.689 | -0.798 |
| -1.72500000000007 | -0.611 | -0.691 | -0.802 |
| -1.72000000000007 | -0.613 | -0.694 | -0.805 |
| -1.71500000000007 | -0.615 | -0.696 | -0.808 |
| -1.71000000000007 | -0.617 | -0.699 | -0.812 |
| -1.70500000000007 | -0.619 | -0.702 | -0.815 |
| -1.70000000000007 | -0.621 | -0.704 | -0.819 |
| -1.69500000000007 | -0.623 | -0.707 | -0.822 |
| -1.69000000000007 | -0.625 | -0.71 | -0.826 |
| -1.685000000000071 | -0.627 | -0.712 | -0.829 |
| -1.680000000000071 | -0.629 | -0.715 | -0.833 |
| -1.675000000000071 | -0.631 | -0.718 | -0.837 |
| -1.670000000000071 | -0.633 | -0.721 | -0.84 |
| -1.665000000000071 | -0.635 | -0.724 | -0.844 |
| -1.660000000000071 | -0.637 | -0.726 | -0.848 |
| -1.655000000000071 | -0.639 | -0.729 | -0.852 |
| -1.650000000000071 | -0.641 | -0.732 | -0.855 |
| -1.645000000000071 | -0.644 | -0.735 | -0.859 |
| -1.640000000000072 | -0.646 | -0.738 | -0.863 |
| -1.635000000000072 | -0.648 | -0.741 | -0.867 |
| -1.630000000000072 | -0.65 | -0.744 | -0.871 |
| -1.625000000000072 | -0.652 | -0.747 | -0.875 |
| -1.620000000000072 | -0.655 | -0.75 | -0.879 |
| -1.615000000000072 | -0.657 | -0.753 | -0.883 |
| -1.610000000000072 | -0.659 | -0.756 | -0.887 |
| -1.605000000000072 | -0.661 | -0.759 | -0.891 |
| -1.600000000000072 | -0.664 | -0.762 | -0.895 |
| -1.595000000000073 | -0.666 | -0.765 | -0.899 |
| -1.590000000000073 | -0.668 | -0.768 | -0.903 |
| -1.585000000000073 | -0.671 | -0.772 | -0.908 |
| -1.580000000000073 | -0.673 | -0.775 | -0.912 |
| -1.575000000000073 | -0.675 | -0.778 | -0.916 |
| -1.570000000000073 | -0.678 | -0.781 | -0.921 |
| -1.565000000000073 | -0.68 | -0.785 | -0.925 |
| -1.560000000000073 | -0.683 | -0.788 | -0.93 |
| -1.555000000000073 | -0.685 | -0.791 | -0.934 |
| -1.550000000000074 | -0.687 | -0.795 | -0.938 |
| -1.545000000000074 | -0.69 | -0.798 | -0.943 |
| -1.540000000000074 | -0.692 | -0.802 | -0.948 |
| -1.535000000000074 | -0.695 | -0.805 | -0.952 |
| -1.530000000000074 | -0.698 | -0.809 | -0.957 |
| -1.525000000000074 | -0.7 | -0.812 | -0.962 |
| -1.520000000000074 | -0.703 | -0.816 | -0.966 |
| -1.515000000000074 | -0.705 | -0.819 | -0.971 |
| -1.510000000000074 | -0.708 | -0.823 | -0.976 |
| -1.505000000000074 | -0.711 | -0.827 | -0.981 |
| -1.500000000000075 | -0.713 | -0.83 | -0.986 |
| -1.495000000000075 | -0.716 | -0.834 | -0.991 |
| -1.490000000000075 | -0.719 | -0.838 | -0.996 |
| -1.485000000000075 | -0.721 | -0.841 | -1.001 |
| -1.480000000000075 | -0.724 | -0.845 | -1.006 |
| -1.475000000000075 | -0.727 | -0.849 | -1.011 |
| -1.470000000000075 | -0.73 | -0.853 | -1.017 |
| -1.465000000000075 | -0.732 | -0.857 | -1.022 |
| -1.460000000000075 | -0.735 | -0.861 | -1.027 |
| -1.455000000000076 | -0.738 | -0.865 | -1.033 |
| -1.450000000000076 | -0.741 | -0.869 | -1.038 |
| -1.445000000000076 | -0.744 | -0.873 | -1.044 |
| -1.440000000000076 | -0.747 | -0.877 | -1.049 |
| -1.435000000000076 | -0.75 | -0.881 | -1.055 |
| -1.430000000000076 | -0.753 | -0.885 | -1.06 |
| -1.425000000000076 | -0.756 | -0.89 | -1.066 |
| -1.420000000000076 | -0.759 | -0.894 | -1.072 |
| -1.415000000000076 | -0.762 | -0.898 | -1.078 |
| -1.410000000000077 | -0.765 | -0.903 | -1.084 |
| -1.405000000000077 | -0.768 | -0.907 | -1.089 |
| -1.400000000000077 | -0.771 | -0.911 | -1.095 |
| -1.395000000000077 | -0.774 | -0.916 | -1.102 |
| -1.390000000000077 | -0.777 | -0.92 | -1.108 |
| -1.385000000000077 | -0.781 | -0.925 | -1.114 |
| -1.380000000000077 | -0.784 | -0.93 | -1.12 |
| -1.375000000000077 | -0.787 | -0.934 | -1.126 |
| -1.370000000000077 | -0.79 | -0.939 | -1.133 |
| -1.365000000000077 | -0.794 | -0.944 | -1.139 |
| -1.360000000000078 | -0.797 | -0.948 | -1.146 |
| -1.355000000000078 | -0.8 | -0.953 | -1.152 |
| -1.350000000000078 | -0.804 | -0.958 | -1.159 |
| -1.345000000000078 | -0.807 | -0.963 | -1.166 |
| -1.340000000000078 | -0.811 | -0.968 | -1.173 |
| -1.335000000000078 | -0.814 | -0.973 | -1.179 |
| -1.330000000000078 | -0.818 | -0.978 | -1.186 |
| -1.325000000000078 | -0.821 | -0.983 | -1.193 |
| -1.320000000000078 | -0.825 | -0.988 | -1.2 |
| -1.315000000000079 | -0.828 | -0.994 | -1.208 |
| -1.310000000000079 | -0.832 | -0.999 | -1.215 |
| -1.305000000000079 | -0.836 | -1.004 | -1.222 |
| -1.300000000000079 | -0.839 | -1.01 | -1.23 |
| -1.295000000000079 | -0.843 | -1.015 | -1.237 |
| -1.29000000000008 | -0.847 | -1.021 | -1.245 |
| -1.285000000000079 | -0.851 | -1.026 | -1.252 |
| -1.280000000000079 | -0.855 | -1.032 | -1.26 |
| -1.275000000000079 | -0.859 | -1.038 | -1.268 |
| -1.270000000000079 | -0.862 | -1.043 | -1.276 |
| -1.26500000000008 | -0.866 | -1.049 | -1.284 |
| -1.26000000000008 | -0.87 | -1.055 | -1.292 |
| -1.25500000000008 | -0.875 | -1.061 | -1.3 |
| -1.25000000000008 | -0.879 | -1.067 | -1.308 |
| -1.24500000000008 | -0.883 | -1.073 | -1.317 |
| -1.24000000000008 | -0.887 | -1.079 | -1.325 |
| -1.23500000000008 | -0.891 | -1.085 | -1.334 |
| -1.23000000000008 | -0.895 | -1.092 | -1.342 |
| -1.22500000000008 | -0.9 | -1.098 | -1.351 |
| -1.220000000000081 | -0.904 | -1.104 | -1.36 |
| -1.215000000000081 | -0.908 | -1.111 | -1.369 |
| -1.210000000000081 | -0.913 | -1.117 | -1.378 |
| -1.205000000000081 | -0.917 | -1.124 | -1.387 |
| -1.200000000000081 | -0.922 | -1.131 | -1.396 |
| -1.195000000000081 | -0.926 | -1.138 | -1.406 |
| -1.190000000000081 | -0.931 | -1.144 | -1.415 |
| -1.185000000000081 | -0.935 | -1.151 | -1.425 |
| -1.180000000000081 | -0.94 | -1.158 | -1.435 |
| -1.175000000000082 | -0.945 | -1.166 | -1.445 |
| -1.170000000000082 | -0.95 | -1.173 | -1.455 |
| -1.165000000000082 | -0.954 | -1.18 | -1.465 |
| -1.160000000000082 | -0.959 | -1.187 | -1.475 |
| -1.155000000000082 | -0.964 | -1.195 | -1.485 |
| -1.150000000000082 | -0.969 | -1.202 | -1.496 |
| -1.145000000000082 | -0.974 | -1.21 | -1.506 |
| -1.140000000000082 | -0.979 | -1.218 | -1.517 |
| -1.135000000000082 | -0.984 | -1.226 | -1.528 |
| -1.130000000000082 | -0.99 | -1.233 | -1.539 |
| -1.125000000000083 | -0.995 | -1.241 | -1.55 |
| -1.120000000000083 | -1 | -1.25 | -1.562 |
| -1.115000000000083 | -1.006 | -1.258 | -1.573 |
| -1.110000000000083 | -1.011 | -1.266 | -1.585 |
| -1.105000000000083 | -1.017 | -1.274 | -1.597 |
| -1.100000000000083 | -1.022 | -1.283 | -1.608 |
| -1.095000000000083 | -1.028 | -1.292 | -1.621 |
| -1.090000000000083 | -1.033 | -1.3 | -1.633 |
| -1.085000000000083 | -1.039 | -1.309 | -1.645 |
| -1.080000000000084 | -1.045 | -1.318 | -1.658 |
| -1.075000000000084 | -1.051 | -1.327 | -1.67 |
| -1.070000000000084 | -1.057 | -1.336 | -1.683 |
| -1.065000000000084 | -1.063 | -1.346 | -1.696 |
| -1.060000000000084 | -1.069 | -1.355 | -1.71 |
| -1.055000000000084 | -1.075 | -1.365 | -1.723 |
| -1.050000000000084 | -1.081 | -1.374 | -1.737 |
| -1.045000000000084 | -1.088 | -1.384 | -1.751 |
| -1.040000000000084 | -1.094 | -1.394 | -1.765 |
| -1.035000000000085 | -1.1 | -1.404 | -1.779 |
| -1.030000000000085 | -1.107 | -1.415 | -1.793 |
| -1.025000000000085 | -1.114 | -1.425 | -1.808 |
| -1.020000000000085 | -1.12 | -1.435 | -1.823 |
| -1.015000000000085 | -1.127 | -1.446 | -1.838 |
| -1.010000000000085 | -1.134 | -1.457 | -1.853 |
| -1.005000000000085 | -1.141 | -1.468 | -1.869 |
| -1.000000000000085 | -1.148 | -1.479 | -1.884 |
| -0.995000000000085 | -1.155 | -1.49 | -1.9 |
| -0.990000000000085 | -1.162 | -1.502 | -1.916 |
| -0.985000000000085 | -1.169 | -1.513 | -1.933 |
| -0.980000000000085 | -1.177 | -1.525 | -1.949 |
| -0.975000000000085 | -1.184 | -1.537 | -1.966 |
| -0.970000000000085 | -1.192 | -1.549 | -1.983 |
| -0.965000000000085 | -1.2 | -1.561 | -2.001 |
| -0.960000000000085 | -1.207 | -1.574 | -2.018 |
| -0.955000000000085 | -1.215 | -1.586 | -2.036 |
| -0.950000000000085 | -1.223 | -1.599 | -2.055 |
| -0.945000000000085 | -1.231 | -1.612 | -2.073 |
| -0.940000000000085 | -1.24 | -1.625 | -2.092 |
| -0.935000000000085 | -1.248 | -1.639 | -2.111 |
| -0.930000000000085 | -1.256 | -1.652 | -2.13 |
| -0.925000000000085 | -1.265 | -1.666 | -2.15 |
| -0.920000000000085 | -1.273 | -1.68 | -2.17 |
| -0.915000000000085 | -1.282 | -1.694 | -2.19 |
| -0.910000000000085 | -1.291 | -1.709 | -2.211 |
| -0.905000000000085 | -1.3 | -1.724 | -2.232 |
| -0.900000000000085 | -1.309 | -1.739 | -2.253 |
| -0.895000000000085 | -1.319 | -1.754 | -2.275 |
| -0.890000000000085 | -1.328 | -1.769 | -2.297 |
| -0.885000000000085 | -1.338 | -1.785 | -2.319 |
| -0.880000000000085 | -1.347 | -1.801 | -2.342 |
| -0.875000000000085 | -1.357 | -1.817 | -2.365 |
| -0.870000000000085 | -1.367 | -1.833 | -2.389 |
| -0.865000000000085 | -1.377 | -1.85 | -2.413 |
| -0.860000000000085 | -1.388 | -1.867 | -2.437 |
| -0.855000000000085 | -1.398 | -1.884 | -2.462 |
| -0.850000000000085 | -1.409 | -1.902 | -2.487 |
| -0.845000000000085 | -1.419 | -1.92 | -2.512 |
| -0.840000000000085 | -1.43 | -1.938 | -2.538 |
| -0.835000000000085 | -1.441 | -1.956 | -2.565 |
| -0.830000000000085 | -1.453 | -1.975 | -2.592 |
| -0.825000000000085 | -1.464 | -1.994 | -2.619 |
| -0.820000000000085 | -1.476 | -2.013 | -2.647 |
| -0.815000000000085 | -1.488 | -2.033 | -2.676 |
| -0.810000000000085 | -1.5 | -2.053 | -2.705 |
| -0.805000000000085 | -1.512 | -2.074 | -2.734 |
| -0.800000000000085 | -1.524 | -2.095 | -2.764 |
| -0.795000000000085 | -1.537 | -2.116 | -2.795 |
| -0.790000000000085 | -1.55 | -2.138 | -2.826 |
| -0.785000000000085 | -1.563 | -2.16 | -2.858 |
| -0.780000000000085 | -1.576 | -2.182 | -2.89 |
| -0.775000000000085 | -1.589 | -2.205 | -2.923 |
| -0.770000000000085 | -1.603 | -2.228 | -2.957 |
| -0.765000000000085 | -1.617 | -2.252 | -2.991 |
| -0.760000000000085 | -1.631 | -2.276 | -3.026 |
| -0.755000000000085 | -1.646 | -2.3 | -3.062 |
| -0.750000000000085 | -1.66 | -2.326 | -3.098 |
| -0.745000000000085 | -1.675 | -2.351 | -3.135 |
| -0.740000000000085 | -1.691 | -2.377 | -3.173 |
| -0.735000000000085 | -1.706 | -2.404 | -3.211 |
| -0.730000000000085 | -1.722 | -2.431 | -3.25 |
| -0.725000000000085 | -1.738 | -2.458 | -3.291 |
| -0.720000000000085 | -1.754 | -2.487 | -3.331 |
| -0.715000000000085 | -1.771 | -2.515 | -3.373 |
| -0.710000000000085 | -1.788 | -2.545 | -3.416 |
| -0.705000000000085 | -1.805 | -2.575 | -3.459 |
| -0.700000000000085 | -1.823 | -2.605 | -3.504 |
| -0.695000000000085 | -1.841 | -2.636 | -3.549 |
| -0.690000000000085 | -1.859 | -2.668 | -3.595 |
| -0.685000000000085 | -1.878 | -2.701 | -3.643 |
| -0.680000000000085 | -1.897 | -2.734 | -3.691 |
| -0.675000000000085 | -1.916 | -2.768 | -3.741 |
| -0.670000000000085 | -1.936 | -2.803 | -3.791 |
| -0.665000000000085 | -1.956 | -2.838 | -3.843 |
| -0.660000000000085 | -1.977 | -2.874 | -3.896 |
| -0.655000000000085 | -1.998 | -2.911 | -3.95 |
| -0.650000000000085 | -2.019 | -2.949 | -4.005 |
| -0.645000000000085 | -2.041 | -2.988 | -4.062 |
| -0.640000000000085 | -2.064 | -3.028 | -4.119 |
| -0.635000000000085 | -2.087 | -3.068 | -4.179 |
| -0.630000000000085 | -2.11 | -3.11 | -4.239 |
| -0.625000000000085 | -2.134 | -3.152 | -4.301 |
| -0.620000000000085 | -2.158 | -3.195 | -4.365 |
| -0.615000000000085 | -2.183 | -3.24 | -4.43 |
| -0.610000000000085 | -2.209 | -3.285 | -4.496 |
| -0.605000000000085 | -2.235 | -3.332 | -4.565 |
| -0.600000000000085 | -2.262 | -3.38 | -4.635 |
| -0.595000000000085 | -2.289 | -3.429 | -4.706 |
| -0.590000000000085 | -2.317 | -3.479 | -4.78 |
| -0.585000000000085 | -2.345 | -3.53 | -4.855 |
| -0.580000000000085 | -2.375 | -3.583 | -4.932 |
| -0.575000000000085 | -2.405 | -3.637 | -5.012 |
| -0.570000000000085 | -2.435 | -3.692 | -5.093 |
| -0.565000000000085 | -2.467 | -3.749 | -5.177 |
| -0.560000000000085 | -2.499 | -3.808 | -5.262 |
| -0.555000000000085 | -2.532 | -3.868 | -5.351 |
| -0.550000000000085 | -2.566 | -3.929 | -5.441 |
| -0.545000000000085 | -2.601 | -3.992 | -5.534 |
| -0.540000000000085 | -2.636 | -4.057 | -5.629 |
| -0.535000000000085 | -2.673 | -4.124 | -5.727 |
| -0.530000000000085 | -2.71 | -4.192 | -5.828 |
| -0.525000000000085 | -2.749 | -4.263 | -5.932 |
| -0.520000000000085 | -2.789 | -4.335 | -6.039 |
| -0.515000000000085 | -2.829 | -4.41 | -6.149 |
| -0.510000000000085 | -2.871 | -4.487 | -6.262 |
| -0.505000000000085 | -2.914 | -4.566 | -6.378 |
| -0.500000000000085 | -2.958 | -4.647 | -6.498 |
| -0.495000000000085 | -3.003 | -4.73 | -6.622 |
| -0.490000000000085 | -3.05 | -4.817 | -6.749 |
| -0.485000000000085 | -3.098 | -4.906 | -6.88 |
| -0.480000000000085 | -3.147 | -4.997 | -7.015 |
| -0.475000000000085 | -3.198 | -5.092 | -7.155 |
| -0.470000000000085 | -3.251 | -5.189 | -7.299 |
| -0.465000000000085 | -3.305 | -5.289 | -7.447 |
| -0.460000000000085 | -3.36 | -5.393 | -7.601 |
| -0.455000000000085 | -3.418 | -5.5 | -7.759 |
| -0.450000000000085 | -3.477 | -5.611 | -7.923 |
| -0.445000000000085 | -3.538 | -5.725 | -8.092 |
| -0.440000000000085 | -3.601 | -5.844 | -8.267 |
| -0.435000000000085 | -3.666 | -5.966 | -8.448 |
| -0.430000000000085 | -3.734 | -6.092 | -8.636 |
| -0.425000000000085 | -3.803 | -6.223 | -8.829 |
| -0.420000000000085 | -3.875 | -6.359 | -9.03 |
| -0.415000000000085 | -3.95 | -6.499 | -9.238 |
| -0.410000000000085 | -4.027 | -6.645 | -9.454 |
| -0.405000000000085 | -4.107 | -6.795 | -9.678 |
| -0.400000000000085 | -4.189 | -6.952 | -9.91 |
| -0.395000000000085 | -4.275 | -7.114 | -10.151 |
| -0.390000000000085 | -4.364 | -7.283 | -10.401 |
| -0.385000000000085 | -4.456 | -7.458 | -10.661 |
| -0.380000000000085 | -4.552 | -7.64 | -10.931 |
| -0.375000000000085 | -4.651 | -7.829 | -11.212 |
| -0.370000000000085 | -4.754 | -8.026 | -11.505 |
| -0.365000000000085 | -4.862 | -8.231 | -11.809 |
| -0.360000000000085 | -4.973 | -8.444 | -12.127 |
| -0.355000000000085 | -5.089 | -8.666 | -12.457 |
| -0.350000000000085 | -5.211 | -8.898 | -12.802 |
| -0.345000000000085 | -5.337 | -9.14 | -13.162 |
| -0.340000000000085 | -5.468 | -9.393 | -13.538 |
| -0.335000000000085 | -5.606 | -9.657 | -13.93 |
| -0.330000000000085 | -5.749 | -9.932 | -14.341 |
| -0.325000000000085 | -5.899 | -10.221 | -14.771 |
| -0.320000000000085 | -6.055 | -10.523 | -15.221 |
| -0.315000000000085 | -6.219 | -10.839 | -15.692 |
| -0.310000000000085 | -6.391 | -11.171 | -16.186 |
| -0.305000000000085 | -6.571 | -11.519 | -16.705 |
| -0.300000000000085 | -6.76 | -11.884 | -17.249 |
| -0.295000000000085 | -6.958 | -12.268 | -17.822 |
| -0.290000000000085 | -7.166 | -12.672 | -18.424 |
| -0.285000000000085 | -7.385 | -13.098 | -19.059 |
| -0.280000000000085 | -7.615 | -13.546 | -19.727 |
| -0.275000000000085 | -7.858 | -14.018 | -20.432 |
| -0.270000000000085 | -8.114 | -14.517 | -21.176 |
| -0.265000000000085 | -8.385 | -15.044 | -21.963 |
| -0.260000000000085 | -8.671 | -15.602 | -22.796 |
| -0.255000000000085 | -8.973 | -16.192 | -23.678 |
| -0.250000000000085 | -9.294 | -16.819 | -24.613 |
| -0.245000000000085 | -9.633 | -17.483 | -25.606 |
| -0.240000000000085 | -9.994 | -18.19 | -26.662 |
| -0.235000000000085 | -10.378 | -18.942 | -27.785 |
| -0.230000000000085 | -10.786 | -19.743 | -28.982 |
| -0.225000000000085 | -11.222 | -20.598 | -30.26 |
| -0.220000000000085 | -11.687 | -21.512 | -31.626 |
| -0.215000000000085 | -12.185 | -22.49 | -33.088 |
| -0.210000000000085 | -12.717 | -23.538 | -34.656 |
| -0.205000000000085 | -13.289 | -24.663 | -36.339 |
| -0.200000000000085 | -13.904 | -25.874 | -38.15 |
| -0.195000000000085 | -14.566 | -27.179 | -40.102 |
| -0.190000000000085 | -15.28 | -28.588 | -42.21 |
| -0.185000000000085 | -16.052 | -30.112 | -44.491 |
| -0.180000000000085 | -16.888 | -31.765 | -46.964 |
| -0.175000000000085 | -17.796 | -33.561 | -49.652 |
| -0.170000000000085 | -18.785 | -35.517 | -52.58 |
| -0.165000000000085 | -19.865 | -37.653 | -55.779 |
| -0.160000000000085 | -21.046 | -39.992 | -59.281 |
| -0.155000000000084 | -22.342 | -42.561 | -63.128 |
| -0.150000000000084 | -23.769 | -45.39 | -67.365 |
| -0.145000000000084 | -25.345 | -48.517 | -72.047 |
| -0.140000000000084 | -27.091 | -51.984 | -77.24 |
| -0.135000000000084 | -29.034 | -55.842 | -83.02 |
| -0.130000000000084 | -31.204 | -60.153 | -89.479 |
| -0.125000000000084 | -33.637 | -64.992 | -96.729 |
| -0.120000000000084 | -36.38 | -70.446 | -104.902 |
| -0.115000000000084 | -39.486 | -76.627 | -114.164 |
| -0.110000000000084 | -43.023 | -83.668 | -124.717 |
| -0.105000000000084 | -47.076 | -91.738 | -136.812 |
| -0.100000000000084 | -51.748 | -101.047 | -150.766 |
| -0.0950000000000844 | -57.176 | -111.863 | -166.979 |
| -0.0900000000000844 | -63.529 | -124.53 | -185.968 |
| -0.0850000000000844 | -71.034 | -139.496 | -208.405 |
| -0.0800000000000844 | -79.985 | -157.353 | -235.178 |
| -0.0750000000000844 | -90.781 | -178.897 | -267.48 |
| -0.0700000000000844 | -103.967 | -205.218 | -306.948 |
| -0.0650000000000844 | -120.307 | -237.841 | -355.867 |
| -0.0600000000000844 | -140.892 | -278.953 | -417.518 |
| -0.0550000000000844 | -167.336 | -331.775 | -496.733 |
| -0.0500000000000844 | -202.095 | -401.221 | -600.881 |
| -0.0450000000000844 | -249.061 | -495.074 | -741.64 |
| -0.0400000000000844 | -314.706 | -626.276 | -938.418 |
| -0.0350000000000844 | -410.436 | -817.636 | -1225.43 |
| -0.0300000000000844 | -557.905 | -1112.459 | -1667.633 |
| -0.0250000000000844 | -802.441 | -1601.394 | -2400.997 |
| -0.0200000000000844 | -1252.553 | -2501.45 | -3751.034 |
| -0.0150000000000844 | -2224.919 | -4445.966 | -6667.749 |
| -0.0100000000000844 | -5002.899 | -10001.623 | -15001.149 |
| -0.00500000000008444 | -20003.246 | -40001.796 | -60001.265 |
| -8.4444604087075e-14 | -70117463416798098246074368 | -140234926833596007513587712 | -210352390250394011270381568 |
| 0.00499999999991555 | -20003.246 | -40001.796 | -60001.265 |
| 0.00999999999991555 | -5002.899 | -10001.623 | -15001.149 |
| 0.0149999999999156 | -2224.919 | -4445.966 | -6667.749 |
| 0.0199999999999156 | -1252.553 | -2501.45 | -3751.034 |
| 0.0249999999999156 | -802.441 | -1601.394 | -2400.997 |
| 0.0299999999999156 | -557.905 | -1112.459 | -1667.633 |
| 0.0349999999999155 | -410.436 | -817.636 | -1225.43 |
| 0.0399999999999155 | -314.706 | -626.276 | -938.418 |
| 0.0449999999999155 | -249.061 | -495.074 | -741.64 |
| 0.0499999999999155 | -202.095 | -401.221 | -600.881 |
| 0.0549999999999155 | -167.336 | -331.775 | -496.733 |
| 0.0599999999999155 | -140.892 | -278.953 | -417.518 |
| 0.0649999999999155 | -120.307 | -237.841 | -355.867 |
| 0.0699999999999155 | -103.967 | -205.218 | -306.948 |
| 0.0749999999999155 | -90.781 | -178.897 | -267.48 |
| 0.0799999999999155 | -79.985 | -157.353 | -235.178 |
| 0.0849999999999155 | -71.034 | -139.496 | -208.405 |
| 0.0899999999999155 | -63.529 | -124.53 | -185.968 |
| 0.0949999999999155 | -57.176 | -111.863 | -166.979 |
| 0.0999999999999155 | -51.748 | -101.047 | -150.766 |
| 0.104999999999916 | -47.076 | -91.738 | -136.812 |
| 0.109999999999916 | -43.023 | -83.668 | -124.717 |
| 0.114999999999916 | -39.486 | -76.627 | -114.164 |
| 0.119999999999916 | -36.38 | -70.446 | -104.902 |
| 0.124999999999916 | -33.637 | -64.992 | -96.729 |
| 0.129999999999916 | -31.204 | -60.153 | -89.479 |
| 0.134999999999916 | -29.034 | -55.842 | -83.02 |
| 0.139999999999916 | -27.091 | -51.984 | -77.24 |
| 0.144999999999916 | -25.345 | -48.517 | -72.047 |
| 0.149999999999916 | -23.769 | -45.39 | -67.365 |
| 0.154999999999916 | -22.342 | -42.561 | -63.128 |
| 0.159999999999916 | -21.046 | -39.992 | -59.281 |
| 0.164999999999916 | -19.865 | -37.653 | -55.779 |
| 0.169999999999916 | -18.785 | -35.517 | -52.58 |
| 0.174999999999916 | -17.796 | -33.561 | -49.652 |
| 0.179999999999916 | -16.888 | -31.765 | -46.964 |
| 0.184999999999916 | -16.052 | -30.112 | -44.491 |
| 0.189999999999916 | -15.28 | -28.588 | -42.21 |
| 0.194999999999916 | -14.566 | -27.179 | -40.102 |
| 0.199999999999916 | -13.904 | -25.874 | -38.15 |
| 0.204999999999916 | -13.289 | -24.663 | -36.339 |
| 0.209999999999916 | -12.717 | -23.538 | -34.656 |
| 0.214999999999916 | -12.185 | -22.49 | -33.088 |
| 0.219999999999916 | -11.687 | -21.512 | -31.626 |
| 0.224999999999916 | -11.222 | -20.598 | -30.26 |
| 0.229999999999916 | -10.786 | -19.743 | -28.982 |
| 0.234999999999916 | -10.378 | -18.942 | -27.785 |
| 0.239999999999916 | -9.994 | -18.19 | -26.662 |
| 0.244999999999916 | -9.633 | -17.483 | -25.606 |
| 0.249999999999916 | -9.294 | -16.819 | -24.613 |
| 0.254999999999916 | -8.973 | -16.192 | -23.678 |
| 0.259999999999916 | -8.671 | -15.602 | -22.796 |
| 0.264999999999916 | -8.385 | -15.044 | -21.963 |
| 0.269999999999916 | -8.114 | -14.517 | -21.176 |
| 0.274999999999916 | -7.858 | -14.018 | -20.432 |
| 0.279999999999916 | -7.615 | -13.546 | -19.727 |
| 0.284999999999916 | -7.385 | -13.098 | -19.059 |
| 0.289999999999916 | -7.166 | -12.672 | -18.424 |
| 0.294999999999916 | -6.958 | -12.268 | -17.822 |
| 0.299999999999916 | -6.76 | -11.884 | -17.249 |
| 0.304999999999916 | -6.571 | -11.519 | -16.705 |
| 0.309999999999916 | -6.391 | -11.171 | -16.186 |
| 0.314999999999916 | -6.219 | -10.839 | -15.692 |
| 0.319999999999916 | -6.055 | -10.523 | -15.221 |
| 0.324999999999916 | -5.899 | -10.221 | -14.771 |
| 0.329999999999916 | -5.749 | -9.932 | -14.341 |
| 0.334999999999916 | -5.606 | -9.657 | -13.93 |
| 0.339999999999916 | -5.468 | -9.393 | -13.538 |
| 0.344999999999916 | -5.337 | -9.14 | -13.162 |
| 0.349999999999916 | -5.211 | -8.898 | -12.802 |
| 0.354999999999916 | -5.089 | -8.666 | -12.457 |
| 0.359999999999916 | -4.973 | -8.444 | -12.127 |
| 0.364999999999916 | -4.862 | -8.231 | -11.809 |
| 0.369999999999916 | -4.754 | -8.026 | -11.505 |
| 0.374999999999916 | -4.651 | -7.829 | -11.212 |
| 0.379999999999916 | -4.552 | -7.64 | -10.931 |
| 0.384999999999916 | -4.456 | -7.458 | -10.661 |
| 0.389999999999916 | -4.364 | -7.283 | -10.401 |
| 0.394999999999916 | -4.275 | -7.114 | -10.151 |
| 0.399999999999916 | -4.189 | -6.952 | -9.91 |
| 0.404999999999916 | -4.107 | -6.795 | -9.678 |
| 0.409999999999916 | -4.027 | -6.645 | -9.454 |
| 0.414999999999916 | -3.95 | -6.499 | -9.238 |
| 0.419999999999916 | -3.875 | -6.359 | -9.03 |
| 0.424999999999916 | -3.803 | -6.223 | -8.829 |
| 0.429999999999916 | -3.734 | -6.092 | -8.636 |
| 0.434999999999916 | -3.666 | -5.966 | -8.448 |
| 0.439999999999916 | -3.601 | -5.844 | -8.267 |
| 0.444999999999916 | -3.538 | -5.725 | -8.092 |
| 0.449999999999916 | -3.477 | -5.611 | -7.923 |
| 0.454999999999916 | -3.418 | -5.5 | -7.759 |
| 0.459999999999916 | -3.36 | -5.393 | -7.601 |
| 0.464999999999916 | -3.305 | -5.289 | -7.447 |
| 0.469999999999916 | -3.251 | -5.189 | -7.299 |
| 0.474999999999916 | -3.198 | -5.092 | -7.155 |
| 0.479999999999916 | -3.147 | -4.997 | -7.015 |
| 0.484999999999916 | -3.098 | -4.906 | -6.88 |
| 0.489999999999916 | -3.05 | -4.817 | -6.749 |
| 0.494999999999916 | -3.003 | -4.73 | -6.622 |
| 0.499999999999916 | -2.958 | -4.647 | -6.498 |
| 0.504999999999916 | -2.914 | -4.566 | -6.378 |
| 0.509999999999916 | -2.871 | -4.487 | -6.262 |
| 0.514999999999916 | -2.829 | -4.41 | -6.149 |
| 0.519999999999916 | -2.789 | -4.335 | -6.039 |
| 0.524999999999916 | -2.749 | -4.263 | -5.932 |
| 0.529999999999916 | -2.71 | -4.192 | -5.828 |
| 0.534999999999916 | -2.673 | -4.124 | -5.727 |
| 0.539999999999916 | -2.636 | -4.057 | -5.629 |
| 0.544999999999916 | -2.601 | -3.992 | -5.534 |
| 0.549999999999916 | -2.566 | -3.929 | -5.441 |
| 0.554999999999916 | -2.532 | -3.868 | -5.351 |
| 0.559999999999916 | -2.499 | -3.808 | -5.262 |
| 0.564999999999916 | -2.467 | -3.749 | -5.177 |
| 0.569999999999916 | -2.435 | -3.692 | -5.093 |
| 0.574999999999916 | -2.405 | -3.637 | -5.012 |
| 0.579999999999916 | -2.375 | -3.583 | -4.932 |
| 0.584999999999916 | -2.345 | -3.53 | -4.855 |
| 0.589999999999916 | -2.317 | -3.479 | -4.78 |
| 0.594999999999916 | -2.289 | -3.429 | -4.706 |
| 0.599999999999916 | -2.262 | -3.38 | -4.635 |
| 0.604999999999916 | -2.235 | -3.332 | -4.565 |
| 0.609999999999916 | -2.209 | -3.285 | -4.496 |
| 0.614999999999916 | -2.183 | -3.24 | -4.43 |
| 0.619999999999916 | -2.158 | -3.195 | -4.365 |
| 0.624999999999916 | -2.134 | -3.152 | -4.301 |
| 0.629999999999916 | -2.11 | -3.11 | -4.239 |
| 0.634999999999916 | -2.087 | -3.068 | -4.179 |
| 0.639999999999916 | -2.064 | -3.028 | -4.119 |
| 0.644999999999916 | -2.041 | -2.988 | -4.062 |
| 0.649999999999916 | -2.019 | -2.949 | -4.005 |
| 0.654999999999916 | -1.998 | -2.911 | -3.95 |
| 0.659999999999916 | -1.977 | -2.874 | -3.896 |
| 0.664999999999916 | -1.956 | -2.838 | -3.843 |
| 0.669999999999916 | -1.936 | -2.803 | -3.791 |
| 0.674999999999916 | -1.916 | -2.768 | -3.741 |
| 0.679999999999916 | -1.897 | -2.734 | -3.691 |
| 0.684999999999916 | -1.878 | -2.701 | -3.643 |
| 0.689999999999916 | -1.859 | -2.668 | -3.595 |
| 0.694999999999916 | -1.841 | -2.636 | -3.549 |
| 0.699999999999916 | -1.823 | -2.605 | -3.504 |
| 0.704999999999916 | -1.805 | -2.575 | -3.459 |
| 0.709999999999916 | -1.788 | -2.545 | -3.416 |
| 0.714999999999916 | -1.771 | -2.515 | -3.373 |
| 0.719999999999916 | -1.754 | -2.487 | -3.331 |
| 0.724999999999916 | -1.738 | -2.458 | -3.291 |
| 0.729999999999916 | -1.722 | -2.431 | -3.25 |
| 0.734999999999916 | -1.706 | -2.404 | -3.211 |
| 0.739999999999916 | -1.691 | -2.377 | -3.173 |
| 0.744999999999916 | -1.675 | -2.351 | -3.135 |
| 0.749999999999916 | -1.66 | -2.326 | -3.098 |
| 0.754999999999916 | -1.646 | -2.3 | -3.062 |
| 0.759999999999916 | -1.631 | -2.276 | -3.026 |
| 0.764999999999916 | -1.617 | -2.252 | -2.991 |
| 0.769999999999916 | -1.603 | -2.228 | -2.957 |
| 0.774999999999916 | -1.589 | -2.205 | -2.923 |
| 0.779999999999916 | -1.576 | -2.182 | -2.89 |
| 0.784999999999916 | -1.563 | -2.16 | -2.858 |
| 0.789999999999916 | -1.55 | -2.138 | -2.826 |
| 0.794999999999916 | -1.537 | -2.116 | -2.795 |
| 0.799999999999916 | -1.524 | -2.095 | -2.764 |
| 0.804999999999916 | -1.512 | -2.074 | -2.734 |
| 0.809999999999916 | -1.5 | -2.053 | -2.705 |
| 0.814999999999916 | -1.488 | -2.033 | -2.676 |
| 0.819999999999916 | -1.476 | -2.013 | -2.647 |
| 0.824999999999916 | -1.464 | -1.994 | -2.619 |
| 0.829999999999916 | -1.453 | -1.975 | -2.592 |
| 0.834999999999916 | -1.441 | -1.956 | -2.565 |
| 0.839999999999916 | -1.43 | -1.938 | -2.538 |
| 0.844999999999916 | -1.419 | -1.92 | -2.512 |
| 0.849999999999916 | -1.409 | -1.902 | -2.487 |
| 0.854999999999916 | -1.398 | -1.884 | -2.462 |
| 0.859999999999916 | -1.388 | -1.867 | -2.437 |
| 0.864999999999916 | -1.377 | -1.85 | -2.413 |
| 0.869999999999916 | -1.367 | -1.833 | -2.389 |
| 0.874999999999916 | -1.357 | -1.817 | -2.365 |
| 0.879999999999916 | -1.347 | -1.801 | -2.342 |
| 0.884999999999916 | -1.338 | -1.785 | -2.319 |
| 0.889999999999916 | -1.328 | -1.769 | -2.297 |
| 0.894999999999916 | -1.319 | -1.754 | -2.275 |
| 0.899999999999916 | -1.309 | -1.739 | -2.253 |
| 0.904999999999916 | -1.3 | -1.724 | -2.232 |
| 0.909999999999916 | -1.291 | -1.709 | -2.211 |
| 0.914999999999916 | -1.282 | -1.694 | -2.19 |
| 0.919999999999916 | -1.273 | -1.68 | -2.17 |
| 0.924999999999916 | -1.265 | -1.666 | -2.15 |
| 0.929999999999916 | -1.256 | -1.652 | -2.13 |
| 0.934999999999916 | -1.248 | -1.639 | -2.111 |
| 0.939999999999916 | -1.24 | -1.625 | -2.092 |
| 0.944999999999916 | -1.231 | -1.612 | -2.073 |
| 0.949999999999916 | -1.223 | -1.599 | -2.055 |
| 0.954999999999916 | -1.215 | -1.586 | -2.036 |
| 0.959999999999916 | -1.207 | -1.574 | -2.018 |
| 0.964999999999916 | -1.2 | -1.561 | -2.001 |
| 0.969999999999916 | -1.192 | -1.549 | -1.983 |
| 0.974999999999916 | -1.184 | -1.537 | -1.966 |
| 0.979999999999916 | -1.177 | -1.525 | -1.949 |
| 0.984999999999916 | -1.169 | -1.513 | -1.933 |
| 0.989999999999916 | -1.162 | -1.502 | -1.916 |
| 0.994999999999916 | -1.155 | -1.49 | -1.9 |
| 0.999999999999916 | -1.148 | -1.479 | -1.884 |
| 1.004999999999916 | -1.141 | -1.468 | -1.869 |
| 1.009999999999916 | -1.134 | -1.457 | -1.853 |
| 1.014999999999916 | -1.127 | -1.446 | -1.838 |
| 1.019999999999916 | -1.12 | -1.435 | -1.823 |
| 1.024999999999916 | -1.114 | -1.425 | -1.808 |
| 1.029999999999916 | -1.107 | -1.415 | -1.793 |
| 1.034999999999916 | -1.1 | -1.404 | -1.779 |
| 1.039999999999915 | -1.094 | -1.394 | -1.765 |
| 1.044999999999915 | -1.088 | -1.384 | -1.751 |
| 1.049999999999915 | -1.081 | -1.374 | -1.737 |
| 1.054999999999915 | -1.075 | -1.365 | -1.723 |
| 1.059999999999915 | -1.069 | -1.355 | -1.71 |
| 1.064999999999915 | -1.063 | -1.346 | -1.696 |
| 1.069999999999915 | -1.057 | -1.336 | -1.683 |
| 1.074999999999915 | -1.051 | -1.327 | -1.67 |
| 1.079999999999915 | -1.045 | -1.318 | -1.658 |
| 1.084999999999914 | -1.039 | -1.309 | -1.645 |
| 1.089999999999914 | -1.033 | -1.3 | -1.633 |
| 1.094999999999914 | -1.028 | -1.292 | -1.621 |
| 1.099999999999914 | -1.022 | -1.283 | -1.608 |
| 1.104999999999914 | -1.017 | -1.274 | -1.597 |
| 1.109999999999914 | -1.011 | -1.266 | -1.585 |
| 1.114999999999914 | -1.006 | -1.258 | -1.573 |
| 1.119999999999914 | -1 | -1.25 | -1.562 |
| 1.124999999999914 | -0.995 | -1.241 | -1.55 |
| 1.129999999999914 | -0.99 | -1.233 | -1.539 |
| 1.134999999999913 | -0.984 | -1.226 | -1.528 |
| 1.139999999999913 | -0.979 | -1.218 | -1.517 |
| 1.144999999999913 | -0.974 | -1.21 | -1.506 |
| 1.149999999999913 | -0.969 | -1.202 | -1.496 |
| 1.154999999999913 | -0.964 | -1.195 | -1.485 |
| 1.159999999999913 | -0.959 | -1.187 | -1.475 |
| 1.164999999999913 | -0.954 | -1.18 | -1.465 |
| 1.169999999999913 | -0.95 | -1.173 | -1.455 |
| 1.174999999999913 | -0.945 | -1.166 | -1.445 |
| 1.179999999999912 | -0.94 | -1.158 | -1.435 |
| 1.184999999999912 | -0.935 | -1.151 | -1.425 |
| 1.189999999999912 | -0.931 | -1.144 | -1.415 |
| 1.194999999999912 | -0.926 | -1.138 | -1.406 |
| 1.199999999999912 | -0.922 | -1.131 | -1.396 |
| 1.204999999999912 | -0.917 | -1.124 | -1.387 |
| 1.209999999999912 | -0.913 | -1.117 | -1.378 |
| 1.214999999999912 | -0.908 | -1.111 | -1.369 |
| 1.219999999999912 | -0.904 | -1.104 | -1.36 |
| 1.224999999999911 | -0.9 | -1.098 | -1.351 |
| 1.229999999999911 | -0.895 | -1.092 | -1.342 |
| 1.234999999999911 | -0.891 | -1.085 | -1.334 |
| 1.239999999999911 | -0.887 | -1.079 | -1.325 |
| 1.244999999999911 | -0.883 | -1.073 | -1.317 |
| 1.249999999999911 | -0.879 | -1.067 | -1.308 |
| 1.254999999999911 | -0.875 | -1.061 | -1.3 |
| 1.259999999999911 | -0.87 | -1.055 | -1.292 |
| 1.264999999999911 | -0.866 | -1.049 | -1.284 |
| 1.269999999999911 | -0.862 | -1.043 | -1.276 |
| 1.27499999999991 | -0.859 | -1.038 | -1.268 |
| 1.27999999999991 | -0.855 | -1.032 | -1.26 |
| 1.28499999999991 | -0.851 | -1.026 | -1.252 |
| 1.28999999999991 | -0.847 | -1.021 | -1.245 |
| 1.29499999999991 | -0.843 | -1.015 | -1.237 |
| 1.29999999999991 | -0.839 | -1.01 | -1.23 |
| 1.30499999999991 | -0.836 | -1.004 | -1.222 |
| 1.30999999999991 | -0.832 | -0.999 | -1.215 |
| 1.31499999999991 | -0.828 | -0.994 | -1.208 |
| 1.319999999999909 | -0.825 | -0.988 | -1.2 |
| 1.324999999999909 | -0.821 | -0.983 | -1.193 |
| 1.329999999999909 | -0.818 | -0.978 | -1.186 |
| 1.334999999999909 | -0.814 | -0.973 | -1.179 |
| 1.339999999999909 | -0.811 | -0.968 | -1.173 |
| 1.344999999999909 | -0.807 | -0.963 | -1.166 |
| 1.349999999999909 | -0.804 | -0.958 | -1.159 |
| 1.354999999999909 | -0.8 | -0.953 | -1.152 |
| 1.359999999999909 | -0.797 | -0.948 | -1.146 |
| 1.364999999999908 | -0.794 | -0.944 | -1.139 |
| 1.369999999999908 | -0.79 | -0.939 | -1.133 |
| 1.374999999999908 | -0.787 | -0.934 | -1.126 |
| 1.379999999999908 | -0.784 | -0.93 | -1.12 |
| 1.384999999999908 | -0.781 | -0.925 | -1.114 |
| 1.389999999999908 | -0.777 | -0.92 | -1.108 |
| 1.394999999999908 | -0.774 | -0.916 | -1.102 |
| 1.399999999999908 | -0.771 | -0.911 | -1.095 |
| 1.404999999999908 | -0.768 | -0.907 | -1.089 |
| 1.409999999999908 | -0.765 | -0.903 | -1.084 |
| 1.414999999999907 | -0.762 | -0.898 | -1.078 |
| 1.419999999999907 | -0.759 | -0.894 | -1.072 |
| 1.424999999999907 | -0.756 | -0.89 | -1.066 |
| 1.429999999999907 | -0.753 | -0.885 | -1.06 |
| 1.434999999999907 | -0.75 | -0.881 | -1.055 |
| 1.439999999999907 | -0.747 | -0.877 | -1.049 |
| 1.444999999999907 | -0.744 | -0.873 | -1.044 |
| 1.449999999999907 | -0.741 | -0.869 | -1.038 |
| 1.454999999999907 | -0.738 | -0.865 | -1.033 |
| 1.459999999999906 | -0.735 | -0.861 | -1.027 |
| 1.464999999999906 | -0.732 | -0.857 | -1.022 |
| 1.469999999999906 | -0.73 | -0.853 | -1.017 |
| 1.474999999999906 | -0.727 | -0.849 | -1.011 |
| 1.479999999999906 | -0.724 | -0.845 | -1.006 |
| 1.484999999999906 | -0.721 | -0.841 | -1.001 |
| 1.489999999999906 | -0.719 | -0.838 | -0.996 |
| 1.494999999999906 | -0.716 | -0.834 | -0.991 |
| 1.499999999999906 | -0.713 | -0.83 | -0.986 |
| 1.504999999999906 | -0.711 | -0.827 | -0.981 |
| 1.509999999999905 | -0.708 | -0.823 | -0.976 |
| 1.514999999999905 | -0.705 | -0.819 | -0.971 |
| 1.519999999999905 | -0.703 | -0.816 | -0.966 |
| 1.524999999999905 | -0.7 | -0.812 | -0.962 |
| 1.529999999999905 | -0.698 | -0.809 | -0.957 |
| 1.534999999999905 | -0.695 | -0.805 | -0.952 |
| 1.539999999999905 | -0.692 | -0.802 | -0.948 |
| 1.544999999999905 | -0.69 | -0.798 | -0.943 |
| 1.549999999999905 | -0.687 | -0.795 | -0.938 |
| 1.554999999999904 | -0.685 | -0.791 | -0.934 |
| 1.559999999999904 | -0.683 | -0.788 | -0.93 |
| 1.564999999999904 | -0.68 | -0.785 | -0.925 |
| 1.569999999999904 | -0.678 | -0.781 | -0.921 |
| 1.574999999999904 | -0.675 | -0.778 | -0.916 |
| 1.579999999999904 | -0.673 | -0.775 | -0.912 |
| 1.584999999999904 | -0.671 | -0.772 | -0.908 |
| 1.589999999999904 | -0.668 | -0.768 | -0.903 |
| 1.594999999999904 | -0.666 | -0.765 | -0.899 |
| 1.599999999999903 | -0.664 | -0.762 | -0.895 |
| 1.604999999999903 | -0.661 | -0.759 | -0.891 |
| 1.609999999999903 | -0.659 | -0.756 | -0.887 |
| 1.614999999999903 | -0.657 | -0.753 | -0.883 |
| 1.619999999999903 | -0.655 | -0.75 | -0.879 |
| 1.624999999999903 | -0.652 | -0.747 | -0.875 |
| 1.629999999999903 | -0.65 | -0.744 | -0.871 |
| 1.634999999999903 | -0.648 | -0.741 | -0.867 |
| 1.639999999999903 | -0.646 | -0.738 | -0.863 |
| 1.644999999999902 | -0.644 | -0.735 | -0.859 |
| 1.649999999999902 | -0.641 | -0.732 | -0.855 |
| 1.654999999999902 | -0.639 | -0.729 | -0.852 |
| 1.659999999999902 | -0.637 | -0.726 | -0.848 |
| 1.664999999999902 | -0.635 | -0.724 | -0.844 |
| 1.669999999999902 | -0.633 | -0.721 | -0.84 |
| 1.674999999999902 | -0.631 | -0.718 | -0.837 |
| 1.679999999999902 | -0.629 | -0.715 | -0.833 |
| 1.684999999999902 | -0.627 | -0.712 | -0.829 |
| 1.689999999999901 | -0.625 | -0.71 | -0.826 |
| 1.694999999999901 | -0.623 | -0.707 | -0.822 |
| 1.699999999999901 | -0.621 | -0.704 | -0.819 |
| 1.704999999999901 | -0.619 | -0.702 | -0.815 |
| 1.709999999999901 | -0.617 | -0.699 | -0.812 |
| 1.714999999999901 | -0.615 | -0.696 | -0.808 |
| 1.719999999999901 | -0.613 | -0.694 | -0.805 |
| 1.724999999999901 | -0.611 | -0.691 | -0.802 |
| 1.729999999999901 | -0.609 | -0.689 | -0.798 |
| 1.734999999999901 | -0.607 | -0.686 | -0.795 |
| 1.7399999999999 | -0.605 | -0.684 | -0.792 |
| 1.7449999999999 | -0.603 | -0.681 | -0.788 |
| 1.7499999999999 | -0.601 | -0.679 | -0.785 |
| 1.7549999999999 | -0.599 | -0.676 | -0.782 |
| 1.7599999999999 | -0.597 | -0.674 | -0.779 |
| 1.7649999999999 | -0.596 | -0.671 | -0.775 |
| 1.7699999999999 | -0.594 | -0.669 | -0.772 |
| 1.7749999999999 | -0.592 | -0.666 | -0.769 |
| 1.7799999999999 | -0.59 | -0.664 | -0.766 |
| 1.784999999999899 | -0.588 | -0.662 | -0.763 |
| 1.789999999999899 | -0.586 | -0.659 | -0.76 |
| 1.794999999999899 | -0.585 | -0.657 | -0.757 |
| 1.799999999999899 | -0.583 | -0.655 | -0.754 |
| 1.804999999999899 | -0.581 | -0.652 | -0.751 |
| 1.809999999999899 | -0.579 | -0.65 | -0.748 |
| 1.814999999999899 | -0.578 | -0.648 | -0.745 |
| 1.819999999999899 | -0.576 | -0.646 | -0.742 |
| 1.824999999999899 | -0.574 | -0.643 | -0.739 |
| 1.829999999999899 | -0.573 | -0.641 | -0.736 |
| 1.834999999999898 | -0.571 | -0.639 | -0.733 |
| 1.839999999999898 | -0.569 | -0.637 | -0.731 |
| 1.844999999999898 | -0.567 | -0.635 | -0.728 |
| 1.849999999999898 | -0.566 | -0.632 | -0.725 |
| 1.854999999999898 | -0.564 | -0.63 | -0.722 |
| 1.859999999999898 | -0.563 | -0.628 | -0.719 |
| 1.864999999999898 | -0.561 | -0.626 | -0.717 |
| 1.869999999999898 | -0.559 | -0.624 | -0.714 |
| 1.874999999999898 | -0.558 | -0.622 | -0.711 |
| 1.879999999999897 | -0.556 | -0.62 | -0.709 |
| 1.884999999999897 | -0.554 | -0.618 | -0.706 |
| 1.889999999999897 | -0.553 | -0.616 | -0.703 |
| 1.894999999999897 | -0.551 | -0.614 | -0.701 |
| 1.899999999999897 | -0.55 | -0.612 | -0.698 |
| 1.904999999999897 | -0.548 | -0.61 | -0.696 |
| 1.909999999999897 | -0.547 | -0.608 | -0.693 |
| 1.914999999999897 | -0.545 | -0.606 | -0.69 |
| 1.919999999999897 | -0.544 | -0.604 | -0.688 |
| 1.924999999999897 | -0.542 | -0.602 | -0.685 |
| 1.929999999999896 | -0.54 | -0.6 | -0.683 |
| 1.934999999999896 | -0.539 | -0.598 | -0.68 |
| 1.939999999999896 | -0.537 | -0.596 | -0.678 |
| 1.944999999999896 | -0.536 | -0.594 | -0.676 |
| 1.949999999999896 | -0.534 | -0.592 | -0.673 |
| 1.954999999999896 | -0.533 | -0.59 | -0.671 |
| 1.959999999999896 | -0.532 | -0.588 | -0.668 |
| 1.964999999999896 | -0.53 | -0.587 | -0.666 |
| 1.969999999999896 | -0.529 | -0.585 | -0.664 |
| 1.974999999999895 | -0.527 | -0.583 | -0.661 |
| 1.979999999999895 | -0.526 | -0.581 | -0.659 |
| 1.984999999999895 | -0.524 | -0.579 | -0.657 |
| 1.989999999999895 | -0.523 | -0.577 | -0.654 |
| 1.994999999999895 | -0.522 | -0.576 | -0.652 |
| 1.999999999999895 | -0.52 | -0.574 | -0.65 |
| 2.004999999999895 | -0.519 | -0.572 | -0.648 |
| 2.009999999999895 | -0.517 | -0.57 | -0.645 |
| 2.014999999999895 | -0.516 | -0.569 | -0.643 |
| 2.019999999999895 | -0.515 | -0.567 | -0.641 |
| 2.024999999999895 | -0.513 | -0.565 | -0.639 |
| 2.029999999999895 | -0.512 | -0.563 | -0.637 |
| 2.034999999999894 | -0.511 | -0.562 | -0.634 |
| 2.039999999999894 | -0.509 | -0.56 | -0.632 |
| 2.044999999999894 | -0.508 | -0.558 | -0.63 |
| 2.049999999999894 | -0.507 | -0.557 | -0.628 |
| 2.054999999999894 | -0.505 | -0.555 | -0.626 |
| 2.059999999999894 | -0.504 | -0.553 | -0.624 |
| 2.064999999999894 | -0.503 | -0.552 | -0.622 |
| 2.069999999999894 | -0.501 | -0.55 | -0.62 |
| 2.074999999999894 | -0.5 | -0.549 | -0.618 |
| 2.079999999999893 | -0.499 | -0.547 | -0.616 |
| 2.084999999999893 | -0.497 | -0.545 | -0.614 |
| 2.089999999999893 | -0.496 | -0.544 | -0.612 |
| 2.094999999999893 | -0.495 | -0.542 | -0.61 |
| 2.099999999999893 | -0.494 | -0.541 | -0.608 |
| 2.104999999999893 | -0.492 | -0.539 | -0.606 |
| 2.109999999999893 | -0.491 | -0.538 | -0.604 |
| 2.114999999999893 | -0.49 | -0.536 | -0.602 |
| 2.119999999999893 | -0.489 | -0.534 | -0.6 |
| 2.124999999999893 | -0.487 | -0.533 | -0.598 |
| 2.129999999999892 | -0.486 | -0.531 | -0.596 |
| 2.134999999999892 | -0.485 | -0.53 | -0.594 |
| 2.139999999999892 | -0.484 | -0.528 | -0.592 |
| 2.144999999999892 | -0.483 | -0.527 | -0.59 |
| 2.149999999999892 | -0.481 | -0.525 | -0.588 |
| 2.154999999999892 | -0.48 | -0.524 | -0.587 |
| 2.159999999999892 | -0.479 | -0.522 | -0.585 |
| 2.164999999999892 | -0.478 | -0.521 | -0.583 |
| 2.169999999999892 | -0.477 | -0.52 | -0.581 |
| 2.174999999999891 | -0.475 | -0.518 | -0.579 |
| 2.179999999999891 | -0.474 | -0.517 | -0.578 |
| 2.184999999999891 | -0.473 | -0.515 | -0.576 |
| 2.189999999999891 | -0.472 | -0.514 | -0.574 |
| 2.194999999999891 | -0.471 | -0.512 | -0.572 |
| 2.199999999999891 | -0.47 | -0.511 | -0.57 |
| 2.204999999999891 | -0.469 | -0.51 | -0.569 |
| 2.209999999999891 | -0.467 | -0.508 | -0.567 |
| 2.214999999999891 | -0.466 | -0.507 | -0.565 |
| 2.21999999999989 | -0.465 | -0.506 | -0.564 |
| 2.22499999999989 | -0.464 | -0.504 | -0.562 |
| 2.22999999999989 | -0.463 | -0.503 | -0.56 |
| 2.23499999999989 | -0.462 | -0.501 | -0.558 |
| 2.23999999999989 | -0.461 | -0.5 | -0.557 |
| 2.24499999999989 | -0.46 | -0.499 | -0.555 |
| 2.24999999999989 | -0.459 | -0.497 | -0.553 |
| 2.25499999999989 | -0.458 | -0.496 | -0.552 |
| 2.25999999999989 | -0.457 | -0.495 | -0.55 |
| 2.26499999999989 | -0.455 | -0.494 | -0.549 |
| 2.269999999999889 | -0.454 | -0.492 | -0.547 |
| 2.274999999999889 | -0.453 | -0.491 | -0.545 |
| 2.279999999999889 | -0.452 | -0.49 | -0.544 |
| 2.284999999999889 | -0.451 | -0.488 | -0.542 |
| 2.289999999999889 | -0.45 | -0.487 | -0.541 |
| 2.294999999999889 | -0.449 | -0.486 | -0.539 |
| 2.299999999999889 | -0.448 | -0.485 | -0.537 |
| 2.304999999999889 | -0.447 | -0.483 | -0.536 |
| 2.309999999999889 | -0.446 | -0.482 | -0.534 |
| 2.314999999999888 | -0.445 | -0.481 | -0.533 |
| 2.319999999999888 | -0.444 | -0.48 | -0.531 |
| 2.324999999999888 | -0.443 | -0.478 | -0.53 |
| 2.329999999999888 | -0.442 | -0.477 | -0.528 |
| 2.334999999999888 | -0.441 | -0.476 | -0.527 |
| 2.339999999999888 | -0.44 | -0.475 | -0.525 |
| 2.344999999999888 | -0.439 | -0.474 | -0.524 |
| 2.349999999999888 | -0.438 | -0.472 | -0.522 |
| 2.354999999999888 | -0.437 | -0.471 | -0.521 |
| 2.359999999999887 | -0.436 | -0.47 | -0.519 |
| 2.364999999999887 | -0.435 | -0.469 | -0.518 |
| 2.369999999999887 | -0.434 | -0.468 | -0.517 |
| 2.374999999999887 | -0.433 | -0.467 | -0.515 |
| 2.379999999999887 | -0.432 | -0.465 | -0.514 |
| 2.384999999999887 | -0.431 | -0.464 | -0.512 |
| 2.389999999999887 | -0.43 | -0.463 | -0.511 |
| 2.394999999999887 | -0.429 | -0.462 | -0.509 |
| 2.399999999999887 | -0.428 | -0.461 | -0.508 |
| 2.404999999999887 | -0.427 | -0.46 | -0.507 |
| 2.409999999999886 | -0.427 | -0.459 | -0.505 |
| 2.414999999999886 | -0.426 | -0.457 | -0.504 |
| 2.419999999999886 | -0.425 | -0.456 | -0.503 |
| 2.424999999999886 | -0.424 | -0.455 | -0.501 |
| 2.429999999999886 | -0.423 | -0.454 | -0.5 |
| 2.434999999999886 | -0.422 | -0.453 | -0.499 |
| 2.439999999999886 | -0.421 | -0.452 | -0.497 |
| 2.444999999999886 | -0.42 | -0.451 | -0.496 |
| 2.449999999999886 | -0.419 | -0.45 | -0.495 |
| 2.454999999999885 | -0.418 | -0.449 | -0.493 |
| 2.459999999999885 | -0.417 | -0.448 | -0.492 |
| 2.464999999999885 | -0.417 | -0.447 | -0.491 |
| 2.469999999999885 | -0.416 | -0.446 | -0.489 |
| 2.474999999999885 | -0.415 | -0.444 | -0.488 |
| 2.479999999999885 | -0.414 | -0.443 | -0.487 |
| 2.484999999999885 | -0.413 | -0.442 | -0.486 |
| 2.489999999999885 | -0.412 | -0.441 | -0.484 |
| 2.494999999999885 | -0.411 | -0.44 | -0.483 |
| 2.499999999999884 | -0.41 | -0.439 | -0.482 |
| 2.504999999999884 | -0.41 | -0.438 | -0.48 |
| 2.509999999999884 | -0.409 | -0.437 | -0.479 |
| 2.514999999999884 | -0.408 | -0.436 | -0.478 |
| 2.519999999999884 | -0.407 | -0.435 | -0.477 |
| 2.524999999999884 | -0.406 | -0.434 | -0.476 |
| 2.529999999999884 | -0.405 | -0.433 | -0.474 |
| 2.534999999999884 | -0.404 | -0.432 | -0.473 |
| 2.539999999999884 | -0.404 | -0.431 | -0.472 |
| 2.544999999999884 | -0.403 | -0.43 | -0.471 |
| 2.549999999999883 | -0.402 | -0.429 | -0.47 |
| 2.554999999999883 | -0.401 | -0.428 | -0.468 |
| 2.559999999999883 | -0.4 | -0.427 | -0.467 |
| 2.564999999999883 | -0.4 | -0.426 | -0.466 |
| 2.569999999999883 | -0.399 | -0.425 | -0.465 |
| 2.574999999999883 | -0.398 | -0.424 | -0.464 |
| 2.579999999999883 | -0.397 | -0.424 | -0.463 |
| 2.584999999999883 | -0.396 | -0.423 | -0.461 |
| 2.589999999999883 | -0.395 | -0.422 | -0.46 |
| 2.594999999999882 | -0.395 | -0.421 | -0.459 |
| 2.599999999999882 | -0.394 | -0.42 | -0.458 |
| 2.604999999999882 | -0.393 | -0.419 | -0.457 |
| 2.609999999999882 | -0.392 | -0.418 | -0.456 |
| 2.614999999999882 | -0.392 | -0.417 | -0.455 |
| 2.619999999999882 | -0.391 | -0.416 | -0.454 |
| 2.624999999999882 | -0.39 | -0.415 | -0.452 |
| 2.629999999999882 | -0.389 | -0.414 | -0.451 |
| 2.634999999999882 | -0.388 | -0.413 | -0.45 |
| 2.639999999999881 | -0.388 | -0.412 | -0.449 |
| 2.644999999999881 | -0.387 | -0.412 | -0.448 |
| 2.649999999999881 | -0.386 | -0.411 | -0.447 |
| 2.654999999999881 | -0.385 | -0.41 | -0.446 |
| 2.659999999999881 | -0.385 | -0.409 | -0.445 |
| 2.664999999999881 | -0.384 | -0.408 | -0.444 |
| 2.669999999999881 | -0.383 | -0.407 | -0.443 |
| 2.674999999999881 | -0.382 | -0.406 | -0.442 |
| 2.679999999999881 | -0.382 | -0.405 | -0.441 |
| 2.68499999999988 | -0.381 | -0.404 | -0.44 |
| 2.68999999999988 | -0.38 | -0.404 | -0.439 |
| 2.69499999999988 | -0.379 | -0.403 | -0.437 |
| 2.69999999999988 | -0.379 | -0.402 | -0.436 |
| 2.70499999999988 | -0.378 | -0.401 | -0.435 |
| 2.70999999999988 | -0.377 | -0.4 | -0.434 |
| 2.71499999999988 | -0.376 | -0.399 | -0.433 |
| 2.71999999999988 | -0.376 | -0.399 | -0.432 |
| 2.72499999999988 | -0.375 | -0.398 | -0.431 |
| 2.72999999999988 | -0.374 | -0.397 | -0.43 |
| 2.734999999999879 | -0.374 | -0.396 | -0.429 |
| 2.739999999999879 | -0.373 | -0.395 | -0.428 |
| 2.744999999999879 | -0.372 | -0.394 | -0.427 |
| 2.749999999999879 | -0.371 | -0.394 | -0.426 |
| 2.754999999999879 | -0.371 | -0.393 | -0.425 |
| 2.759999999999879 | -0.37 | -0.392 | -0.424 |
| 2.764999999999879 | -0.369 | -0.391 | -0.424 |
| 2.769999999999879 | -0.369 | -0.39 | -0.423 |
| 2.774999999999879 | -0.368 | -0.389 | -0.422 |
| 2.779999999999878 | -0.367 | -0.389 | -0.421 |
| 2.784999999999878 | -0.367 | -0.388 | -0.42 |
| 2.789999999999878 | -0.366 | -0.387 | -0.419 |
| 2.794999999999878 | -0.365 | -0.386 | -0.418 |
| 2.799999999999878 | -0.365 | -0.386 | -0.417 |
| 2.804999999999878 | -0.364 | -0.385 | -0.416 |
| 2.809999999999878 | -0.363 | -0.384 | -0.415 |
| 2.814999999999878 | -0.363 | -0.383 | -0.414 |
| 2.819999999999878 | -0.362 | -0.382 | -0.413 |
| 2.824999999999878 | -0.361 | -0.382 | -0.412 |
| 2.829999999999877 | -0.361 | -0.381 | -0.411 |
| 2.834999999999877 | -0.36 | -0.38 | -0.41 |
| 2.839999999999877 | -0.359 | -0.379 | -0.41 |
| 2.844999999999877 | -0.359 | -0.379 | -0.409 |
| 2.849999999999877 | -0.358 | -0.378 | -0.408 |
| 2.854999999999877 | -0.357 | -0.377 | -0.407 |
| 2.859999999999877 | -0.357 | -0.376 | -0.406 |
| 2.864999999999877 | -0.356 | -0.376 | -0.405 |
| 2.869999999999877 | -0.355 | -0.375 | -0.404 |
| 2.874999999999876 | -0.355 | -0.374 | -0.403 |
| 2.879999999999876 | -0.354 | -0.373 | -0.402 |
| 2.884999999999876 | -0.353 | -0.373 | -0.402 |
| 2.889999999999876 | -0.353 | -0.372 | -0.401 |
| 2.894999999999876 | -0.352 | -0.371 | -0.4 |
| 2.899999999999876 | -0.352 | -0.37 | -0.399 |
| 2.904999999999876 | -0.351 | -0.37 | -0.398 |
| 2.909999999999876 | -0.35 | -0.369 | -0.397 |
| 2.914999999999876 | -0.35 | -0.368 | -0.396 |
| 2.919999999999876 | -0.349 | -0.368 | -0.396 |
| 2.924999999999875 | -0.348 | -0.367 | -0.395 |
| 2.929999999999875 | -0.348 | -0.366 | -0.394 |
| 2.934999999999875 | -0.347 | -0.365 | -0.393 |
| 2.939999999999875 | -0.347 | -0.365 | -0.392 |
| 2.944999999999875 | -0.346 | -0.364 | -0.391 |
| 2.949999999999875 | -0.345 | -0.363 | -0.391 |
| 2.954999999999875 | -0.345 | -0.363 | -0.39 |
| 2.959999999999875 | -0.344 | -0.362 | -0.389 |
| 2.964999999999875 | -0.344 | -0.361 | -0.388 |
| 2.969999999999874 | -0.343 | -0.361 | -0.387 |
| 2.974999999999874 | -0.342 | -0.36 | -0.387 |
| 2.979999999999874 | -0.342 | -0.359 | -0.386 |
| 2.984999999999874 | -0.341 | -0.359 | -0.385 |
| 2.989999999999874 | -0.341 | -0.358 | -0.384 |
| 2.994999999999874 | -0.34 | -0.357 | -0.383 |
| 2.999999999999874 | -0.339 | -0.357 | -0.383 |
| 3.004999999999874 | -0.339 | -0.356 | -0.382 |
| 3.009999999999874 | -0.338 | -0.355 | -0.381 |
| 3.014999999999874 | -0.338 | -0.355 | -0.38 |
| 3.019999999999873 | -0.337 | -0.354 | -0.379 |
| 3.024999999999873 | -0.337 | -0.353 | -0.379 |
| 3.029999999999873 | -0.336 | -0.353 | -0.378 |
| 3.034999999999873 | -0.335 | -0.352 | -0.377 |
| 3.039999999999873 | -0.335 | -0.351 | -0.376 |
| 3.044999999999873 | -0.334 | -0.351 | -0.376 |
| 3.049999999999873 | -0.334 | -0.35 | -0.375 |
| 3.054999999999873 | -0.333 | -0.349 | -0.374 |
| 3.059999999999873 | -0.333 | -0.349 | -0.373 |
| 3.064999999999872 | -0.332 | -0.348 | -0.373 |
| 3.069999999999872 | -0.331 | -0.347 | -0.372 |
| 3.074999999999872 | -0.331 | -0.347 | -0.371 |
| 3.079999999999872 | -0.33 | -0.346 | -0.37 |
| 3.084999999999872 | -0.33 | -0.346 | -0.37 |
| 3.089999999999872 | -0.329 | -0.345 | -0.369 |
| 3.094999999999872 | -0.329 | -0.344 | -0.368 |
| 3.099999999999872 | -0.328 | -0.344 | -0.368 |
| 3.104999999999872 | -0.328 | -0.343 | -0.367 |
| 3.109999999999872 | -0.327 | -0.343 | -0.366 |
| 3.114999999999871 | -0.326 | -0.342 | -0.365 |
| 3.119999999999871 | -0.326 | -0.341 | -0.365 |
| 3.124999999999871 | -0.325 | -0.341 | -0.364 |
| 3.129999999999871 | -0.325 | -0.34 | -0.363 |
| 3.134999999999871 | -0.324 | -0.339 | -0.363 |
| 3.139999999999871 | -0.324 | -0.339 | -0.362 |
| 3.144999999999871 | -0.323 | -0.338 | -0.361 |
| 3.149999999999871 | -0.323 | -0.338 | -0.36 |
| 3.154999999999871 | -0.322 | -0.337 | -0.36 |
| 3.15999999999987 | -0.322 | -0.336 | -0.359 |
| 3.16499999999987 | -0.321 | -0.336 | -0.358 |
| 3.16999999999987 | -0.321 | -0.335 | -0.358 |
| 3.17499999999987 | -0.32 | -0.335 | -0.357 |
| 3.17999999999987 | -0.32 | -0.334 | -0.356 |
| 3.18499999999987 | -0.319 | -0.334 | -0.356 |
| 3.18999999999987 | -0.319 | -0.333 | -0.355 |
| 3.19499999999987 | -0.318 | -0.332 | -0.354 |
| 3.19999999999987 | -0.318 | -0.332 | -0.354 |
| 3.204999999999869 | -0.317 | -0.331 | -0.353 |
| 3.209999999999869 | -0.316 | -0.331 | -0.352 |
| 3.214999999999869 | -0.316 | -0.33 | -0.352 |
| 3.219999999999869 | -0.315 | -0.33 | -0.351 |
| 3.224999999999869 | -0.315 | -0.329 | -0.35 |
| 3.229999999999869 | -0.314 | -0.328 | -0.35 |
| 3.234999999999869 | -0.314 | -0.328 | -0.349 |
| 3.239999999999869 | -0.313 | -0.327 | -0.348 |
| 3.244999999999869 | -0.313 | -0.327 | -0.348 |
| 3.249999999999869 | -0.312 | -0.326 | -0.347 |
| 3.254999999999868 | -0.312 | -0.326 | -0.346 |
| 3.259999999999868 | -0.311 | -0.325 | -0.346 |
| 3.264999999999868 | -0.311 | -0.324 | -0.345 |
| 3.269999999999868 | -0.311 | -0.324 | -0.344 |
| 3.274999999999868 | -0.31 | -0.323 | -0.344 |
| 3.279999999999868 | -0.31 | -0.323 | -0.343 |
| 3.284999999999868 | -0.309 | -0.322 | -0.343 |
| 3.289999999999868 | -0.309 | -0.322 | -0.342 |
| 3.294999999999868 | -0.308 | -0.321 | -0.341 |
| 3.299999999999867 | -0.308 | -0.321 | -0.341 |
| 3.304999999999867 | -0.307 | -0.32 | -0.34 |
| 3.309999999999867 | -0.307 | -0.32 | -0.339 |
| 3.314999999999867 | -0.306 | -0.319 | -0.339 |
| 3.319999999999867 | -0.306 | -0.319 | -0.338 |
| 3.324999999999867 | -0.305 | -0.318 | -0.338 |
| 3.329999999999867 | -0.305 | -0.317 | -0.337 |
| 3.334999999999867 | -0.304 | -0.317 | -0.336 |
| 3.339999999999867 | -0.304 | -0.316 | -0.336 |
| 3.344999999999866 | -0.303 | -0.316 | -0.335 |
| 3.349999999999866 | -0.303 | -0.315 | -0.335 |
| 3.354999999999866 | -0.302 | -0.315 | -0.334 |
| 3.359999999999866 | -0.302 | -0.314 | -0.333 |
| 3.364999999999866 | -0.301 | -0.314 | -0.333 |
| 3.369999999999866 | -0.301 | -0.313 | -0.332 |
| 3.374999999999866 | -0.301 | -0.313 | -0.332 |
| 3.379999999999866 | -0.3 | -0.312 | -0.331 |
| 3.384999999999866 | -0.3 | -0.312 | -0.33 |
| 3.389999999999866 | -0.299 | -0.311 | -0.33 |
| 3.394999999999865 | -0.299 | -0.311 | -0.329 |
| 3.399999999999865 | -0.298 | -0.31 | -0.329 |
| 3.404999999999865 | -0.298 | -0.31 | -0.328 |
| 3.409999999999865 | -0.297 | -0.309 | -0.328 |
| 3.414999999999865 | -0.297 | -0.309 | -0.327 |
| 3.419999999999865 | -0.297 | -0.308 | -0.326 |
| 3.424999999999865 | -0.296 | -0.308 | -0.326 |
| 3.429999999999865 | -0.296 | -0.307 | -0.325 |
| 3.434999999999865 | -0.295 | -0.307 | -0.325 |
| 3.439999999999864 | -0.295 | -0.306 | -0.324 |
| 3.444999999999864 | -0.294 | -0.306 | -0.324 |
| 3.449999999999864 | -0.294 | -0.305 | -0.323 |
| 3.454999999999864 | -0.293 | -0.305 | -0.323 |
| 3.459999999999864 | -0.293 | -0.304 | -0.322 |
| 3.464999999999864 | -0.293 | -0.304 | -0.321 |
| 3.469999999999864 | -0.292 | -0.303 | -0.321 |
| 3.474999999999864 | -0.292 | -0.303 | -0.32 |
| 3.479999999999864 | -0.291 | -0.302 | -0.32 |
| 3.484999999999864 | -0.291 | -0.302 | -0.319 |
| 3.489999999999863 | -0.29 | -0.302 | -0.319 |
| 3.494999999999863 | -0.29 | -0.301 | -0.318 |
| 3.499999999999863 | -0.29 | -0.301 | -0.318 |
| 3.504999999999863 | -0.289 | -0.3 | -0.317 |
| 3.509999999999863 | -0.289 | -0.3 | -0.317 |
| 3.514999999999863 | -0.288 | -0.299 | -0.316 |
| 3.519999999999863 | -0.288 | -0.299 | -0.315 |
| 3.524999999999863 | -0.287 | -0.298 | -0.315 |
| 3.529999999999863 | -0.287 | -0.298 | -0.314 |
| 3.534999999999862 | -0.287 | -0.297 | -0.314 |
| 3.539999999999862 | -0.286 | -0.297 | -0.313 |
| 3.544999999999862 | -0.286 | -0.296 | -0.313 |
| 3.549999999999862 | -0.285 | -0.296 | -0.312 |
| 3.554999999999862 | -0.285 | -0.295 | -0.312 |
| 3.559999999999862 | -0.285 | -0.295 | -0.311 |
| 3.564999999999862 | -0.284 | -0.295 | -0.311 |
| 3.569999999999862 | -0.284 | -0.294 | -0.31 |
| 3.574999999999862 | -0.283 | -0.294 | -0.31 |
| 3.579999999999862 | -0.283 | -0.293 | -0.309 |
| 3.584999999999861 | -0.283 | -0.293 | -0.309 |
| 3.589999999999861 | -0.282 | -0.292 | -0.308 |
| 3.594999999999861 | -0.282 | -0.292 | -0.308 |
| 3.599999999999861 | -0.281 | -0.291 | -0.307 |
| 3.604999999999861 | -0.281 | -0.291 | -0.307 |
| 3.609999999999861 | -0.281 | -0.291 | -0.306 |
| 3.614999999999861 | -0.28 | -0.29 | -0.306 |
| 3.619999999999861 | -0.28 | -0.29 | -0.305 |
| 3.62499999999986 | -0.279 | -0.289 | -0.305 |
| 3.62999999999986 | -0.279 | -0.289 | -0.304 |
| 3.63499999999986 | -0.279 | -0.288 | -0.304 |
| 3.63999999999986 | -0.278 | -0.288 | -0.303 |
| 3.64499999999986 | -0.278 | -0.288 | -0.303 |
| 3.64999999999986 | -0.277 | -0.287 | -0.302 |
| 3.65499999999986 | -0.277 | -0.287 | -0.302 |
| 3.65999999999986 | -0.277 | -0.286 | -0.301 |
| 3.66499999999986 | -0.276 | -0.286 | -0.301 |
| 3.669999999999859 | -0.276 | -0.285 | -0.3 |
| 3.674999999999859 | -0.275 | -0.285 | -0.3 |
| 3.679999999999859 | -0.275 | -0.285 | -0.299 |
| 3.684999999999859 | -0.275 | -0.284 | -0.299 |
| 3.689999999999859 | -0.274 | -0.284 | -0.298 |
| 3.694999999999859 | -0.274 | -0.283 | -0.298 |
| 3.699999999999859 | -0.274 | -0.283 | -0.297 |
| 3.704999999999859 | -0.273 | -0.282 | -0.297 |
| 3.709999999999859 | -0.273 | -0.282 | -0.297 |
| 3.714999999999859 | -0.272 | -0.282 | -0.296 |
| 3.719999999999858 | -0.272 | -0.281 | -0.296 |
| 3.724999999999858 | -0.272 | -0.281 | -0.295 |
| 3.729999999999858 | -0.271 | -0.28 | -0.295 |
| 3.734999999999858 | -0.271 | -0.28 | -0.294 |
| 3.739999999999858 | -0.271 | -0.28 | -0.294 |
| 3.744999999999858 | -0.27 | -0.279 | -0.293 |
| 3.749999999999858 | -0.27 | -0.279 | -0.293 |
| 3.754999999999858 | -0.269 | -0.278 | -0.292 |
| 3.759999999999858 | -0.269 | -0.278 | -0.292 |
| 3.764999999999857 | -0.269 | -0.278 | -0.292 |
| 3.769999999999857 | -0.268 | -0.277 | -0.291 |
| 3.774999999999857 | -0.268 | -0.277 | -0.291 |
| 3.779999999999857 | -0.268 | -0.276 | -0.29 |
| 3.784999999999857 | -0.267 | -0.276 | -0.29 |
| 3.789999999999857 | -0.267 | -0.276 | -0.289 |
| 3.794999999999857 | -0.267 | -0.275 | -0.289 |
| 3.799999999999857 | -0.266 | -0.275 | -0.288 |
| 3.804999999999857 | -0.266 | -0.274 | -0.288 |
| 3.809999999999857 | -0.265 | -0.274 | -0.287 |
| 3.814999999999856 | -0.265 | -0.274 | -0.287 |
| 3.819999999999856 | -0.265 | -0.273 | -0.287 |
| 3.824999999999856 | -0.264 | -0.273 | -0.286 |
| 3.829999999999856 | -0.264 | -0.273 | -0.286 |
| 3.834999999999856 | -0.264 | -0.272 | -0.285 |
| 3.839999999999856 | -0.263 | -0.272 | -0.285 |
| 3.844999999999856 | -0.263 | -0.271 | -0.284 |
| 3.849999999999856 | -0.263 | -0.271 | -0.284 |
| 3.854999999999856 | -0.262 | -0.271 | -0.284 |
| 3.859999999999855 | -0.262 | -0.27 | -0.283 |
| 3.864999999999855 | -0.262 | -0.27 | -0.283 |
| 3.869999999999855 | -0.261 | -0.269 | -0.282 |
| 3.874999999999855 | -0.261 | -0.269 | -0.282 |
| 3.879999999999855 | -0.261 | -0.269 | -0.281 |
| 3.884999999999855 | -0.26 | -0.268 | -0.281 |
| 3.889999999999855 | -0.26 | -0.268 | -0.281 |
| 3.894999999999855 | -0.26 | -0.268 | -0.28 |
| 3.899999999999855 | -0.259 | -0.267 | -0.28 |
| 3.904999999999855 | -0.259 | -0.267 | -0.279 |
| 3.909999999999854 | -0.259 | -0.267 | -0.279 |
| 3.914999999999854 | -0.258 | -0.266 | -0.279 |
| 3.919999999999854 | -0.258 | -0.266 | -0.278 |
| 3.924999999999854 | -0.258 | -0.265 | -0.278 |
| 3.929999999999854 | -0.257 | -0.265 | -0.277 |
| 3.934999999999854 | -0.257 | -0.265 | -0.277 |
| 3.939999999999854 | -0.257 | -0.264 | -0.277 |
| 3.944999999999854 | -0.256 | -0.264 | -0.276 |
| 3.949999999999854 | -0.256 | -0.264 | -0.276 |
| 3.954999999999853 | -0.256 | -0.263 | -0.275 |
| 3.959999999999853 | -0.255 | -0.263 | -0.275 |
| 3.964999999999853 | -0.255 | -0.263 | -0.275 |
| 3.969999999999853 | -0.255 | -0.262 | -0.274 |
| 3.974999999999853 | -0.254 | -0.262 | -0.274 |
| 3.979999999999853 | -0.254 | -0.261 | -0.273 |
| 3.984999999999853 | -0.254 | -0.261 | -0.273 |
| 3.989999999999853 | -0.253 | -0.261 | -0.273 |
| 3.994999999999853 | -0.253 | -0.26 | -0.272 |
| 3.999999999999853 | -0.253 | -0.26 | -0.272 |
| 4.004999999999852 | -0.252 | -0.26 | -0.271 |
| 4.009999999999852 | -0.252 | -0.259 | -0.271 |
| 4.014999999999852 | -0.252 | -0.259 | -0.271 |
| 4.019999999999852 | -0.251 | -0.259 | -0.27 |
| 4.024999999999852 | -0.251 | -0.258 | -0.27 |
| 4.029999999999852 | -0.251 | -0.258 | -0.269 |
| 4.034999999999852 | -0.25 | -0.258 | -0.269 |
| 4.039999999999851 | -0.25 | -0.257 | -0.269 |
| 4.044999999999852 | -0.25 | -0.257 | -0.268 |
| 4.049999999999851 | -0.249 | -0.257 | -0.268 |
| 4.054999999999851 | -0.249 | -0.256 | -0.268 |
| 4.059999999999851 | -0.249 | -0.256 | -0.267 |
| 4.064999999999851 | -0.248 | -0.256 | -0.267 |
| 4.069999999999851 | -0.248 | -0.255 | -0.266 |
| 4.074999999999851 | -0.248 | -0.255 | -0.266 |
| 4.07999999999985 | -0.248 | -0.255 | -0.266 |
| 4.084999999999851 | -0.247 | -0.254 | -0.265 |
| 4.08999999999985 | -0.247 | -0.254 | -0.265 |
| 4.094999999999851 | -0.247 | -0.254 | -0.265 |
| 4.09999999999985 | -0.246 | -0.253 | -0.264 |
| 4.10499999999985 | -0.246 | -0.253 | -0.264 |
| 4.10999999999985 | -0.246 | -0.253 | -0.263 |
| 4.11499999999985 | -0.245 | -0.252 | -0.263 |
| 4.11999999999985 | -0.245 | -0.252 | -0.263 |
| 4.12499999999985 | -0.245 | -0.252 | -0.262 |
| 4.12999999999985 | -0.244 | -0.251 | -0.262 |
| 4.13499999999985 | -0.244 | -0.251 | -0.262 |
| 4.13999999999985 | -0.244 | -0.251 | -0.261 |
| 4.144999999999849 | -0.244 | -0.25 | -0.261 |
| 4.14999999999985 | -0.243 | -0.25 | -0.261 |
| 4.154999999999849 | -0.243 | -0.25 | -0.26 |
| 4.15999999999985 | -0.243 | -0.249 | -0.26 |
| 4.164999999999849 | -0.242 | -0.249 | -0.259 |
| 4.169999999999849 | -0.242 | -0.249 | -0.259 |
| 4.174999999999849 | -0.242 | -0.248 | -0.259 |
| 4.179999999999848 | -0.241 | -0.248 | -0.258 |
| 4.184999999999849 | -0.241 | -0.248 | -0.258 |
| 4.189999999999848 | -0.241 | -0.247 | -0.258 |
| 4.194999999999848 | -0.241 | -0.247 | -0.257 |
| 4.199999999999848 | -0.24 | -0.247 | -0.257 |
| 4.204999999999848 | -0.24 | -0.246 | -0.257 |
| 4.209999999999848 | -0.24 | -0.246 | -0.256 |
| 4.214999999999848 | -0.239 | -0.246 | -0.256 |
| 4.219999999999847 | -0.239 | -0.246 | -0.256 |
| 4.224999999999848 | -0.239 | -0.245 | -0.255 |
| 4.229999999999847 | -0.239 | -0.245 | -0.255 |
| 4.234999999999847 | -0.238 | -0.245 | -0.255 |
| 4.239999999999847 | -0.238 | -0.244 | -0.254 |
| 4.244999999999847 | -0.238 | -0.244 | -0.254 |
| 4.249999999999847 | -0.237 | -0.244 | -0.254 |
| 4.254999999999847 | -0.237 | -0.243 | -0.253 |
| 4.259999999999846 | -0.237 | -0.243 | -0.253 |
| 4.264999999999847 | -0.237 | -0.243 | -0.253 |
| 4.269999999999846 | -0.236 | -0.242 | -0.252 |
| 4.274999999999846 | -0.236 | -0.242 | -0.252 |
| 4.279999999999846 | -0.236 | -0.242 | -0.252 |
| 4.284999999999846 | -0.235 | -0.242 | -0.251 |
| 4.289999999999846 | -0.235 | -0.241 | -0.251 |
| 4.294999999999846 | -0.235 | -0.241 | -0.251 |
| 4.299999999999846 | -0.235 | -0.241 | -0.25 |
| 4.304999999999846 | -0.234 | -0.24 | -0.25 |
| 4.309999999999845 | -0.234 | -0.24 | -0.25 |
| 4.314999999999846 | -0.234 | -0.24 | -0.249 |
| 4.319999999999845 | -0.234 | -0.24 | -0.249 |
| 4.324999999999846 | -0.233 | -0.239 | -0.249 |
| 4.329999999999845 | -0.233 | -0.239 | -0.248 |
| 4.334999999999845 | -0.233 | -0.239 | -0.248 |
| 4.339999999999845 | -0.232 | -0.238 | -0.248 |
| 4.344999999999845 | -0.232 | -0.238 | -0.247 |
| 4.349999999999845 | -0.232 | -0.238 | -0.247 |
| 4.354999999999845 | -0.232 | -0.237 | -0.247 |
| 4.359999999999844 | -0.231 | -0.237 | -0.246 |
| 4.364999999999845 | -0.231 | -0.237 | -0.246 |
| 4.369999999999844 | -0.231 | -0.237 | -0.246 |
| 4.374999999999844 | -0.231 | -0.236 | -0.245 |
| 4.379999999999844 | -0.23 | -0.236 | -0.245 |
| 4.384999999999844 | -0.23 | -0.236 | -0.245 |
| 4.389999999999844 | -0.23 | -0.235 | -0.244 |
| 4.394999999999844 | -0.229 | -0.235 | -0.244 |
| 4.399999999999844 | -0.229 | -0.235 | -0.244 |
| 4.404999999999844 | -0.229 | -0.235 | -0.244 |
| 4.409999999999843 | -0.229 | -0.234 | -0.243 |
| 4.414999999999844 | -0.228 | -0.234 | -0.243 |
| 4.419999999999843 | -0.228 | -0.234 | -0.243 |
| 4.424999999999843 | -0.228 | -0.233 | -0.242 |
| 4.429999999999843 | -0.228 | -0.233 | -0.242 |
| 4.434999999999843 | -0.227 | -0.233 | -0.242 |
| 4.439999999999843 | -0.227 | -0.233 | -0.241 |
| 4.444999999999843 | -0.227 | -0.232 | -0.241 |
| 4.449999999999842 | -0.227 | -0.232 | -0.241 |
| 4.454999999999843 | -0.226 | -0.232 | -0.24 |
| 4.459999999999842 | -0.226 | -0.232 | -0.24 |
| 4.464999999999843 | -0.226 | -0.231 | -0.24 |
| 4.469999999999842 | -0.226 | -0.231 | -0.24 |
| 4.474999999999842 | -0.225 | -0.231 | -0.239 |
| 4.479999999999842 | -0.225 | -0.23 | -0.239 |
| 4.484999999999842 | -0.225 | -0.23 | -0.239 |
| 4.489999999999842 | -0.225 | -0.23 | -0.238 |
| 4.494999999999842 | -0.224 | -0.23 | -0.238 |
| 4.499999999999841 | -0.224 | -0.229 | -0.238 |
| 4.504999999999842 | -0.224 | -0.229 | -0.237 |
| 4.509999999999841 | -0.224 | -0.229 | -0.237 |
| 4.514999999999842 | -0.223 | -0.229 | -0.237 |
| 4.519999999999841 | -0.223 | -0.228 | -0.237 |
| 4.524999999999841 | -0.223 | -0.228 | -0.236 |
| 4.529999999999841 | -0.223 | -0.228 | -0.236 |
| 4.534999999999841 | -0.222 | -0.227 | -0.236 |
| 4.53999999999984 | -0.222 | -0.227 | -0.235 |
| 4.544999999999841 | -0.222 | -0.227 | -0.235 |
| 4.54999999999984 | -0.222 | -0.227 | -0.235 |
| 4.554999999999841 | -0.221 | -0.226 | -0.235 |
| 4.55999999999984 | -0.221 | -0.226 | -0.234 |
| 4.564999999999841 | -0.221 | -0.226 | -0.234 |
| 4.56999999999984 | -0.221 | -0.226 | -0.234 |
| 4.57499999999984 | -0.22 | -0.225 | -0.233 |
| 4.57999999999984 | -0.22 | -0.225 | -0.233 |
| 4.58499999999984 | -0.22 | -0.225 | -0.233 |
| 4.58999999999984 | -0.22 | -0.225 | -0.233 |
| 4.59499999999984 | -0.219 | -0.224 | -0.232 |
| 4.59999999999984 | -0.219 | -0.224 | -0.232 |
| 4.60499999999984 | -0.219 | -0.224 | -0.232 |
| 4.60999999999984 | -0.219 | -0.224 | -0.231 |
| 4.614999999999839 | -0.218 | -0.223 | -0.231 |
| 4.61999999999984 | -0.218 | -0.223 | -0.231 |
| 4.624999999999839 | -0.218 | -0.223 | -0.231 |
| 4.62999999999984 | -0.218 | -0.223 | -0.23 |
| 4.634999999999839 | -0.217 | -0.222 | -0.23 |
| 4.639999999999838 | -0.217 | -0.222 | -0.23 |
| 4.644999999999839 | -0.217 | -0.222 | -0.229 |
| 4.649999999999838 | -0.217 | -0.222 | -0.229 |
| 4.654999999999839 | -0.216 | -0.221 | -0.229 |
| 4.659999999999838 | -0.216 | -0.221 | -0.229 |
| 4.664999999999838 | -0.216 | -0.221 | -0.228 |
| 4.669999999999838 | -0.216 | -0.221 | -0.228 |
| 4.674999999999838 | -0.216 | -0.22 | -0.228 |
| 4.679999999999837 | -0.215 | -0.22 | -0.228 |
| 4.684999999999838 | -0.215 | -0.22 | -0.227 |
| 4.689999999999837 | -0.215 | -0.22 | -0.227 |
| 4.694999999999838 | -0.215 | -0.219 | -0.227 |
| 4.699999999999837 | -0.214 | -0.219 | -0.226 |
| 4.704999999999837 | -0.214 | -0.219 | -0.226 |
| 4.709999999999837 | -0.214 | -0.219 | -0.226 |
| 4.714999999999837 | -0.214 | -0.218 | -0.226 |
| 4.719999999999837 | -0.213 | -0.218 | -0.225 |
| 4.724999999999837 | -0.213 | -0.218 | -0.225 |
| 4.729999999999836 | -0.213 | -0.218 | -0.225 |
| 4.734999999999836 | -0.213 | -0.217 | -0.225 |
| 4.739999999999836 | -0.213 | -0.217 | -0.224 |
| 4.744999999999836 | -0.212 | -0.217 | -0.224 |
| 4.749999999999836 | -0.212 | -0.217 | -0.224 |
| 4.754999999999836 | -0.212 | -0.216 | -0.224 |
| 4.759999999999836 | -0.212 | -0.216 | -0.223 |
| 4.764999999999836 | -0.211 | -0.216 | -0.223 |
| 4.769999999999836 | -0.211 | -0.216 | -0.223 |
| 4.774999999999835 | -0.211 | -0.215 | -0.222 |
| 4.779999999999835 | -0.211 | -0.215 | -0.222 |
| 4.784999999999835 | -0.21 | -0.215 | -0.222 |
| 4.789999999999835 | -0.21 | -0.215 | -0.222 |
| 4.794999999999835 | -0.21 | -0.214 | -0.221 |
| 4.799999999999835 | -0.21 | -0.214 | -0.221 |
| 4.804999999999835 | -0.21 | -0.214 | -0.221 |
| 4.809999999999835 | -0.209 | -0.214 | -0.221 |
| 4.814999999999835 | -0.209 | -0.214 | -0.22 |
| 4.819999999999835 | -0.209 | -0.213 | -0.22 |
| 4.824999999999835 | -0.209 | -0.213 | -0.22 |
| 4.829999999999834 | -0.209 | -0.213 | -0.22 |
| 4.834999999999834 | -0.208 | -0.213 | -0.219 |
| 4.839999999999834 | -0.208 | -0.212 | -0.219 |
| 4.844999999999834 | -0.208 | -0.212 | -0.219 |
| 4.849999999999834 | -0.208 | -0.212 | -0.219 |
| 4.854999999999834 | -0.207 | -0.212 | -0.218 |
| 4.859999999999834 | -0.207 | -0.211 | -0.218 |
| 4.864999999999834 | -0.207 | -0.211 | -0.218 |
| 4.869999999999834 | -0.207 | -0.211 | -0.218 |
| 4.874999999999834 | -0.207 | -0.211 | -0.217 |
| 4.879999999999833 | -0.206 | -0.211 | -0.217 |
| 4.884999999999834 | -0.206 | -0.21 | -0.217 |
| 4.889999999999833 | -0.206 | -0.21 | -0.217 |
| 4.894999999999833 | -0.206 | -0.21 | -0.216 |
| 4.899999999999833 | -0.205 | -0.21 | -0.216 |
| 4.904999999999833 | -0.205 | -0.209 | -0.216 |
| 4.909999999999833 | -0.205 | -0.209 | -0.216 |
| 4.914999999999833 | -0.205 | -0.209 | -0.215 |
| 4.919999999999832 | -0.205 | -0.209 | -0.215 |
| 4.924999999999833 | -0.204 | -0.208 | -0.215 |
| 4.929999999999832 | -0.204 | -0.208 | -0.215 |
| 4.934999999999832 | -0.204 | -0.208 | -0.215 |
| 4.939999999999832 | -0.204 | -0.208 | -0.214 |
| 4.944999999999832 | -0.204 | -0.208 | -0.214 |
| 4.949999999999832 | -0.203 | -0.207 | -0.214 |
| 4.954999999999832 | -0.203 | -0.207 | -0.214 |
| 4.959999999999832 | -0.203 | -0.207 | -0.213 |
| 4.964999999999832 | -0.203 | -0.207 | -0.213 |
| 4.969999999999831 | -0.203 | -0.207 | -0.213 |
| 4.974999999999831 | -0.202 | -0.206 | -0.213 |
| 4.97999999999983 | -0.202 | -0.206 | -0.212 |
| 4.984999999999831 | -0.202 | -0.206 | -0.212 |
| 4.98999999999983 | -0.202 | -0.206 | -0.212 |
| 4.994999999999831 | -0.202 | -0.205 | -0.212 |
| 4.99999999999983 | -0.201 | -0.205 | -0.211 |